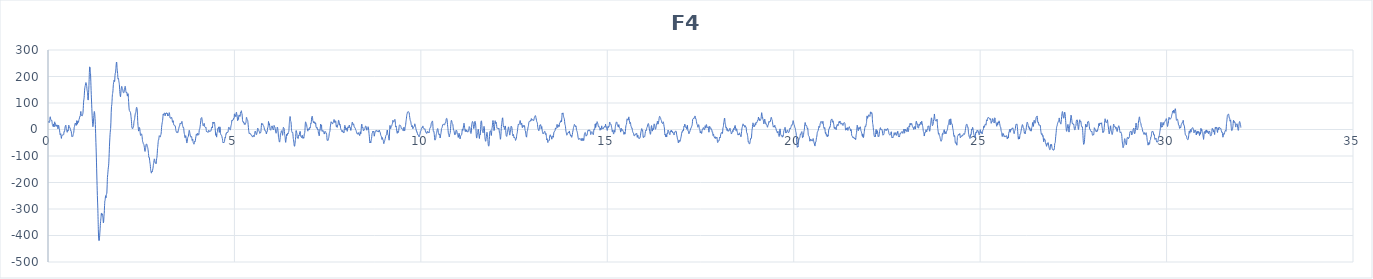
| Category | F4 |
|---|---|
| 0.0 | 24.7 |
| 0.0078125 | 28.9 |
| 0.015625 | 31.4 |
| 0.0234375 | 27.4 |
| 0.03125 | 27.6 |
| 0.0390625 | 26.8 |
| 0.046875 | 31 |
| 0.0546875 | 44.9 |
| 0.0625 | 47.8 |
| 0.0703125 | 40.3 |
| 0.078125 | 37.4 |
| 0.0859375 | 34.8 |
| 0.09375 | 33.5 |
| 0.1015625 | 34.4 |
| 0.109375 | 26.9 |
| 0.1171875 | 18.6 |
| 0.125 | 17.2 |
| 0.1328125 | 12.1 |
| 0.140625 | 12.3 |
| 0.1484375 | 20.6 |
| 0.15625 | 14.6 |
| 0.1640625 | 9.6 |
| 0.171875 | 24.5 |
| 0.1796875 | 29 |
| 0.1875 | 21.6 |
| 0.1953125 | 23 |
| 0.203125 | 18.4 |
| 0.2109375 | 12.3 |
| 0.21875 | 17.4 |
| 0.2265625 | 16 |
| 0.234375 | 12 |
| 0.2421875 | 16.7 |
| 0.25 | 15.9 |
| 0.2578125 | 7.8 |
| 0.265625 | 2.4 |
| 0.2734375 | 6.6 |
| 0.28125 | 15.7 |
| 0.2890625 | 13.8 |
| 0.296875 | 5.8 |
| 0.3046875 | 2 |
| 0.3125 | -5.3 |
| 0.3203125 | -15.6 |
| 0.328125 | -20.4 |
| 0.3359375 | -17.6 |
| 0.34375 | -16.3 |
| 0.3515625 | -27.1 |
| 0.359375 | -33.7 |
| 0.3671875 | -26 |
| 0.375 | -21.8 |
| 0.3828125 | -21.9 |
| 0.390625 | -20.1 |
| 0.3984375 | -20.5 |
| 0.40625 | -19.9 |
| 0.4140625 | -20.1 |
| 0.421875 | -18.5 |
| 0.4296875 | -9 |
| 0.4375 | -6.4 |
| 0.4453125 | -7.1 |
| 0.453125 | 4.2 |
| 0.4609375 | 11.5 |
| 0.46875 | 12.5 |
| 0.4765625 | 16.5 |
| 0.484375 | 9.8 |
| 0.4921875 | -0.5 |
| 0.5 | -0.7 |
| 0.5078125 | -5.7 |
| 0.515625 | -10.5 |
| 0.5234375 | -3.7 |
| 0.53125 | -3.2 |
| 0.5390625 | -5.9 |
| 0.546875 | 5.3 |
| 0.5546875 | 15.7 |
| 0.5625 | 14.8 |
| 0.5703125 | 10.9 |
| 0.578125 | 7 |
| 0.5859375 | 6.7 |
| 0.59375 | 6.8 |
| 0.6015625 | -0.3 |
| 0.609375 | -5.4 |
| 0.6171875 | -4.6 |
| 0.625 | -9.1 |
| 0.6328125 | -19.4 |
| 0.640625 | -26.6 |
| 0.6484375 | -26.3 |
| 0.65625 | -24.3 |
| 0.6640625 | -25.9 |
| 0.671875 | -21.9 |
| 0.6796875 | -15.2 |
| 0.6875 | -14.1 |
| 0.6953125 | -4.9 |
| 0.703125 | 8.3 |
| 0.7109375 | 11.1 |
| 0.71875 | 16.6 |
| 0.7265625 | 22.5 |
| 0.734375 | 20 |
| 0.7421875 | 23.3 |
| 0.75 | 23.9 |
| 0.7578125 | 15.4 |
| 0.765625 | 22.3 |
| 0.7734375 | 33.6 |
| 0.78125 | 25.6 |
| 0.7890625 | 19.9 |
| 0.796875 | 28.8 |
| 0.8046875 | 31.7 |
| 0.8125 | 26.7 |
| 0.8203125 | 29.5 |
| 0.828125 | 36.5 |
| 0.8359375 | 38.7 |
| 0.84375 | 43.3 |
| 0.8515625 | 49.1 |
| 0.859375 | 48.6 |
| 0.8671875 | 53.1 |
| 0.875 | 65.6 |
| 0.8828125 | 67.6 |
| 0.890625 | 57.3 |
| 0.8984375 | 51.7 |
| 0.90625 | 52.4 |
| 0.9140625 | 51.3 |
| 0.921875 | 52.2 |
| 0.9296875 | 57.1 |
| 0.9375 | 62.9 |
| 0.9453125 | 78.7 |
| 0.953125 | 100.9 |
| 0.9609375 | 112.1 |
| 0.96875 | 120.2 |
| 0.9765625 | 137.4 |
| 0.984375 | 153.1 |
| 0.9921875 | 160.9 |
| 1.0 | 165.9 |
| 1.0078125 | 172 |
| 1.015625 | 177 |
| 1.0234375 | 176.1 |
| 1.03125 | 171.1 |
| 1.0390625 | 161.8 |
| 1.046875 | 149.6 |
| 1.0546875 | 143.8 |
| 1.0625 | 134.4 |
| 1.0703125 | 114.8 |
| 1.078125 | 111 |
| 1.0859375 | 129.7 |
| 1.09375 | 151.9 |
| 1.1015625 | 179.8 |
| 1.109375 | 215 |
| 1.1171875 | 236.2 |
| 1.125 | 235.4 |
| 1.1328125 | 226.7 |
| 1.140625 | 212 |
| 1.1484375 | 182.4 |
| 1.15625 | 147.2 |
| 1.1640625 | 119.2 |
| 1.171875 | 93.1 |
| 1.1796875 | 66.1 |
| 1.1875 | 42.6 |
| 1.1953125 | 21.9 |
| 1.203125 | 10.5 |
| 1.2109375 | 15 |
| 1.21875 | 28.4 |
| 1.2265625 | 44.6 |
| 1.234375 | 60.3 |
| 1.2421875 | 68.1 |
| 1.25 | 63.6 |
| 1.2578125 | 50.3 |
| 1.265625 | 31.6 |
| 1.2734375 | 3.4 |
| 1.28125 | -32.3 |
| 1.2890625 | -66.6 |
| 1.296875 | -104.2 |
| 1.3046875 | -148.6 |
| 1.3125 | -191.3 |
| 1.3203125 | -231.2 |
| 1.328125 | -266 |
| 1.3359375 | -297.1 |
| 1.34375 | -339.7 |
| 1.3515625 | -386.7 |
| 1.359375 | -412.9 |
| 1.3671875 | -419.6 |
| 1.375 | -417.6 |
| 1.3828125 | -406.4 |
| 1.390625 | -390.3 |
| 1.3984375 | -372.5 |
| 1.40625 | -354 |
| 1.4140625 | -342.4 |
| 1.421875 | -331.1 |
| 1.4296875 | -316.3 |
| 1.4375 | -316.2 |
| 1.4453125 | -323.5 |
| 1.453125 | -319.9 |
| 1.4609375 | -318.5 |
| 1.46875 | -325.4 |
| 1.4765625 | -337.2 |
| 1.484375 | -352.2 |
| 1.4921875 | -348.6 |
| 1.5 | -330.7 |
| 1.5078125 | -317.2 |
| 1.515625 | -292.4 |
| 1.5234375 | -270.4 |
| 1.53125 | -267.2 |
| 1.5390625 | -255.7 |
| 1.546875 | -249.7 |
| 1.5546875 | -258.1 |
| 1.5625 | -249.2 |
| 1.5703125 | -241.9 |
| 1.578125 | -241.7 |
| 1.5859375 | -213.2 |
| 1.59375 | -181.3 |
| 1.6015625 | -170.2 |
| 1.609375 | -157.3 |
| 1.6171875 | -144.7 |
| 1.625 | -137.2 |
| 1.6328125 | -119.3 |
| 1.640625 | -91.2 |
| 1.6484375 | -63.1 |
| 1.65625 | -39.6 |
| 1.6640625 | -19.7 |
| 1.671875 | -5.6 |
| 1.6796875 | 3.7 |
| 1.6875 | 27.7 |
| 1.6953125 | 64.9 |
| 1.703125 | 86.3 |
| 1.7109375 | 93.9 |
| 1.71875 | 110.9 |
| 1.7265625 | 130 |
| 1.734375 | 137.1 |
| 1.7421875 | 146.2 |
| 1.75 | 164.3 |
| 1.7578125 | 175.1 |
| 1.765625 | 180.9 |
| 1.7734375 | 186.3 |
| 1.78125 | 180.2 |
| 1.7890625 | 182.3 |
| 1.796875 | 203.5 |
| 1.8046875 | 212.1 |
| 1.8125 | 213.3 |
| 1.8203125 | 228.1 |
| 1.828125 | 243.6 |
| 1.8359375 | 254.6 |
| 1.84375 | 252.6 |
| 1.8515625 | 233.5 |
| 1.859375 | 221.8 |
| 1.8671875 | 211.4 |
| 1.875 | 192.4 |
| 1.8828125 | 189.8 |
| 1.890625 | 192.7 |
| 1.8984375 | 183.1 |
| 1.90625 | 177.4 |
| 1.9140625 | 169.1 |
| 1.921875 | 150.6 |
| 1.9296875 | 136.9 |
| 1.9375 | 127.3 |
| 1.9453125 | 123.5 |
| 1.953125 | 135 |
| 1.9609375 | 149.1 |
| 1.96875 | 157.6 |
| 1.9765625 | 162.8 |
| 1.984375 | 159.8 |
| 1.9921875 | 153.5 |
| 2.0 | 151.6 |
| 2.0078125 | 146.5 |
| 2.015625 | 140.3 |
| 2.0234375 | 139.5 |
| 2.03125 | 138.3 |
| 2.0390625 | 140.4 |
| 2.046875 | 149.9 |
| 2.0546875 | 156.2 |
| 2.0625 | 159.6 |
| 2.0703125 | 163.3 |
| 2.078125 | 158.4 |
| 2.0859375 | 147.4 |
| 2.09375 | 140.1 |
| 2.1015625 | 138.5 |
| 2.109375 | 140.8 |
| 2.1171875 | 138.9 |
| 2.125 | 129.4 |
| 2.1328125 | 126.3 |
| 2.140625 | 134.3 |
| 2.1484375 | 135 |
| 2.15625 | 119.9 |
| 2.1640625 | 101.2 |
| 2.171875 | 84.5 |
| 2.1796875 | 72.6 |
| 2.1875 | 70.4 |
| 2.1953125 | 69.9 |
| 2.203125 | 66.4 |
| 2.2109375 | 64.7 |
| 2.21875 | 58.8 |
| 2.2265625 | 48.4 |
| 2.234375 | 38.6 |
| 2.2421875 | 23 |
| 2.25 | 8.8 |
| 2.2578125 | 4.9 |
| 2.265625 | 2.7 |
| 2.2734375 | 3.9 |
| 2.28125 | 8.9 |
| 2.2890625 | 8.9 |
| 2.296875 | 14.4 |
| 2.3046875 | 27.8 |
| 2.3125 | 34 |
| 2.3203125 | 37.3 |
| 2.328125 | 46.1 |
| 2.3359375 | 55 |
| 2.34375 | 61.2 |
| 2.3515625 | 64.1 |
| 2.359375 | 68.5 |
| 2.3671875 | 78.6 |
| 2.375 | 83.8 |
| 2.3828125 | 82.3 |
| 2.390625 | 77.8 |
| 2.3984375 | 58 |
| 2.40625 | 29.7 |
| 2.4140625 | 14.9 |
| 2.421875 | 4.8 |
| 2.4296875 | -6.1 |
| 2.4375 | -3.2 |
| 2.4453125 | 6 |
| 2.453125 | 7.7 |
| 2.4609375 | 3.3 |
| 2.46875 | -7 |
| 2.4765625 | -18.2 |
| 2.484375 | -22.7 |
| 2.4921875 | -21.4 |
| 2.5 | -17.5 |
| 2.5078125 | -16.4 |
| 2.515625 | -19.8 |
| 2.5234375 | -26.3 |
| 2.53125 | -37.6 |
| 2.5390625 | -45.7 |
| 2.546875 | -48.3 |
| 2.5546875 | -52.9 |
| 2.5625 | -55.3 |
| 2.5703125 | -56.4 |
| 2.578125 | -61.9 |
| 2.5859375 | -68.9 |
| 2.59375 | -77.5 |
| 2.6015625 | -82.8 |
| 2.609375 | -79.3 |
| 2.6171875 | -72.3 |
| 2.625 | -62.4 |
| 2.6328125 | -55.2 |
| 2.640625 | -55.4 |
| 2.6484375 | -55.2 |
| 2.65625 | -59 |
| 2.6640625 | -65.8 |
| 2.671875 | -67.5 |
| 2.6796875 | -72.6 |
| 2.6875 | -81.1 |
| 2.6953125 | -90.7 |
| 2.703125 | -104 |
| 2.7109375 | -106.3 |
| 2.71875 | -105.6 |
| 2.7265625 | -117.9 |
| 2.734375 | -126.2 |
| 2.7421875 | -132.6 |
| 2.75 | -147 |
| 2.7578125 | -155.6 |
| 2.765625 | -161.1 |
| 2.7734375 | -164.7 |
| 2.78125 | -158.6 |
| 2.7890625 | -157.4 |
| 2.796875 | -159.8 |
| 2.8046875 | -154 |
| 2.8125 | -148.3 |
| 2.8203125 | -141.2 |
| 2.828125 | -130.9 |
| 2.8359375 | -125 |
| 2.84375 | -117.5 |
| 2.8515625 | -111 |
| 2.859375 | -113 |
| 2.8671875 | -119.2 |
| 2.875 | -125.7 |
| 2.8828125 | -126.7 |
| 2.890625 | -125.9 |
| 2.8984375 | -129.4 |
| 2.90625 | -122.2 |
| 2.9140625 | -109.8 |
| 2.921875 | -104.4 |
| 2.9296875 | -89.8 |
| 2.9375 | -72.1 |
| 2.9453125 | -63.4 |
| 2.953125 | -50.2 |
| 2.9609375 | -40.9 |
| 2.96875 | -39.4 |
| 2.9765625 | -30.1 |
| 2.984375 | -23.4 |
| 2.9921875 | -25 |
| 3.0 | -26.1 |
| 3.0078125 | -28.8 |
| 3.015625 | -26.4 |
| 3.0234375 | -20.2 |
| 3.03125 | -17.7 |
| 3.0390625 | -7.2 |
| 3.046875 | 8.4 |
| 3.0546875 | 17.8 |
| 3.0625 | 25.5 |
| 3.0703125 | 30.5 |
| 3.078125 | 39.7 |
| 3.0859375 | 55.8 |
| 3.09375 | 58.5 |
| 3.1015625 | 53.9 |
| 3.109375 | 58 |
| 3.1171875 | 61.3 |
| 3.125 | 62.8 |
| 3.1328125 | 60.6 |
| 3.140625 | 51.8 |
| 3.1484375 | 53.8 |
| 3.15625 | 61.1 |
| 3.1640625 | 60.2 |
| 3.171875 | 62.3 |
| 3.1796875 | 63.1 |
| 3.1875 | 59.4 |
| 3.1953125 | 62.1 |
| 3.203125 | 59.4 |
| 3.2109375 | 51.1 |
| 3.21875 | 53.2 |
| 3.2265625 | 55.1 |
| 3.234375 | 53.1 |
| 3.2421875 | 58.1 |
| 3.25 | 63.6 |
| 3.2578125 | 61.2 |
| 3.265625 | 52.2 |
| 3.2734375 | 43.7 |
| 3.28125 | 43.3 |
| 3.2890625 | 43.7 |
| 3.296875 | 41.6 |
| 3.3046875 | 44.1 |
| 3.3125 | 46.3 |
| 3.3203125 | 43.7 |
| 3.328125 | 38.7 |
| 3.3359375 | 30.5 |
| 3.34375 | 27.2 |
| 3.3515625 | 32.9 |
| 3.359375 | 32.1 |
| 3.3671875 | 22.1 |
| 3.375 | 16.9 |
| 3.3828125 | 17 |
| 3.390625 | 15.4 |
| 3.3984375 | 14.2 |
| 3.40625 | 15 |
| 3.4140625 | 12.8 |
| 3.421875 | 4.7 |
| 3.4296875 | -3.3 |
| 3.4375 | -6.9 |
| 3.4453125 | -9.8 |
| 3.453125 | -11.7 |
| 3.4609375 | -9.7 |
| 3.46875 | -8.4 |
| 3.4765625 | -11.3 |
| 3.484375 | -11.5 |
| 3.4921875 | -5.3 |
| 3.5 | 0.6 |
| 3.5078125 | 4 |
| 3.515625 | 9 |
| 3.5234375 | 12 |
| 3.53125 | 13.6 |
| 3.5390625 | 20.3 |
| 3.546875 | 24.6 |
| 3.5546875 | 22.4 |
| 3.5625 | 23 |
| 3.5703125 | 23.5 |
| 3.578125 | 22.6 |
| 3.5859375 | 28.5 |
| 3.59375 | 30.3 |
| 3.6015625 | 21.3 |
| 3.609375 | 15.2 |
| 3.6171875 | 11.2 |
| 3.625 | 6.8 |
| 3.6328125 | 8.2 |
| 3.640625 | 4.1 |
| 3.6484375 | -9.1 |
| 3.65625 | -15.7 |
| 3.6640625 | -19.9 |
| 3.671875 | -29.3 |
| 3.6796875 | -30.9 |
| 3.6875 | -24.6 |
| 3.6953125 | -23.5 |
| 3.703125 | -29.5 |
| 3.7109375 | -39.4 |
| 3.71875 | -48.8 |
| 3.7265625 | -50.8 |
| 3.734375 | -44.2 |
| 3.7421875 | -34.7 |
| 3.75 | -29.3 |
| 3.7578125 | -28.2 |
| 3.765625 | -24.7 |
| 3.7734375 | -16.2 |
| 3.78125 | -6.9 |
| 3.7890625 | -2.9 |
| 3.796875 | -6.9 |
| 3.8046875 | -14.2 |
| 3.8125 | -20.7 |
| 3.8203125 | -25.5 |
| 3.828125 | -28.1 |
| 3.8359375 | -29.3 |
| 3.84375 | -27.7 |
| 3.8515625 | -26.7 |
| 3.859375 | -34.6 |
| 3.8671875 | -41.6 |
| 3.875 | -37.2 |
| 3.8828125 | -36.7 |
| 3.890625 | -45.8 |
| 3.8984375 | -50 |
| 3.90625 | -51.5 |
| 3.9140625 | -55.5 |
| 3.921875 | -52 |
| 3.9296875 | -45.1 |
| 3.9375 | -46 |
| 3.9453125 | -46.5 |
| 3.953125 | -40.1 |
| 3.9609375 | -32.6 |
| 3.96875 | -25.9 |
| 3.9765625 | -19.1 |
| 3.984375 | -16.7 |
| 3.9921875 | -21.1 |
| 4.0 | -22.2 |
| 4.0078125 | -15.3 |
| 4.015625 | -14.3 |
| 4.0234375 | -19.8 |
| 4.03125 | -20.5 |
| 4.0390625 | -20.5 |
| 4.046875 | -17.2 |
| 4.0546875 | -4.8 |
| 4.0625 | 1.9 |
| 4.0703125 | 2.2 |
| 4.078125 | 9.5 |
| 4.0859375 | 18.5 |
| 4.09375 | 28.2 |
| 4.1015625 | 40.3 |
| 4.109375 | 43.9 |
| 4.1171875 | 44 |
| 4.125 | 44.6 |
| 4.1328125 | 36.2 |
| 4.140625 | 26.7 |
| 4.1484375 | 22.3 |
| 4.15625 | 16.1 |
| 4.1640625 | 13.2 |
| 4.171875 | 13.9 |
| 4.1796875 | 16.9 |
| 4.1875 | 23.1 |
| 4.1953125 | 19.6 |
| 4.203125 | 10.7 |
| 4.2109375 | 10.1 |
| 4.21875 | 8.7 |
| 4.2265625 | 7.3 |
| 4.234375 | 8.8 |
| 4.2421875 | 0.7 |
| 4.25 | -7.8 |
| 4.2578125 | -6.8 |
| 4.265625 | -8 |
| 4.2734375 | -10.2 |
| 4.28125 | -9.2 |
| 4.2890625 | -10.5 |
| 4.296875 | -10.4 |
| 4.3046875 | -5.7 |
| 4.3125 | -2.5 |
| 4.3203125 | -4.8 |
| 4.328125 | -7.8 |
| 4.3359375 | -7.7 |
| 4.34375 | -6.5 |
| 4.3515625 | -5.3 |
| 4.359375 | -6.1 |
| 4.3671875 | -6.5 |
| 4.375 | -2 |
| 4.3828125 | 3.1 |
| 4.390625 | 8 |
| 4.3984375 | 8.9 |
| 4.40625 | 5.5 |
| 4.4140625 | 15.2 |
| 4.421875 | 27.9 |
| 4.4296875 | 23.9 |
| 4.4375 | 23 |
| 4.4453125 | 28.2 |
| 4.453125 | 26.7 |
| 4.4609375 | 27.5 |
| 4.46875 | 23.2 |
| 4.4765625 | 11.6 |
| 4.484375 | 2.7 |
| 4.4921875 | -13.1 |
| 4.5 | -21.9 |
| 4.5078125 | -16.4 |
| 4.515625 | -24.3 |
| 4.5234375 | -28.8 |
| 4.53125 | -14.2 |
| 4.5390625 | -10.1 |
| 4.546875 | -8.1 |
| 4.5546875 | 4 |
| 4.5625 | 5.1 |
| 4.5703125 | 4.3 |
| 4.578125 | 9.9 |
| 4.5859375 | 2.4 |
| 4.59375 | -11 |
| 4.6015625 | -5.4 |
| 4.609375 | 10.1 |
| 4.6171875 | 5.8 |
| 4.625 | -12.4 |
| 4.6328125 | -18.5 |
| 4.640625 | -19 |
| 4.6484375 | -22.1 |
| 4.65625 | -22.4 |
| 4.6640625 | -26.8 |
| 4.671875 | -32.3 |
| 4.6796875 | -36.1 |
| 4.6875 | -46 |
| 4.6953125 | -49.8 |
| 4.703125 | -47.2 |
| 4.7109375 | -50.5 |
| 4.71875 | -49.3 |
| 4.7265625 | -46.6 |
| 4.734375 | -45.2 |
| 4.7421875 | -34.1 |
| 4.75 | -29.3 |
| 4.7578125 | -32.4 |
| 4.765625 | -23.1 |
| 4.7734375 | -16 |
| 4.78125 | -17.6 |
| 4.7890625 | -12.9 |
| 4.796875 | -10.6 |
| 4.8046875 | -12.7 |
| 4.8125 | -10.8 |
| 4.8203125 | -11.1 |
| 4.828125 | -9.6 |
| 4.8359375 | -0.4 |
| 4.84375 | 7.2 |
| 4.8515625 | 8.9 |
| 4.859375 | 6.9 |
| 4.8671875 | 2.9 |
| 4.875 | 0.3 |
| 4.8828125 | -0.9 |
| 4.890625 | -1.2 |
| 4.8984375 | 4.1 |
| 4.90625 | 12.9 |
| 4.9140625 | 16.9 |
| 4.921875 | 22.2 |
| 4.9296875 | 33 |
| 4.9375 | 35.8 |
| 4.9453125 | 33.2 |
| 4.953125 | 36.1 |
| 4.9609375 | 36 |
| 4.96875 | 36.2 |
| 4.9765625 | 42.3 |
| 4.984375 | 41.2 |
| 4.9921875 | 43.2 |
| 5.0 | 57.8 |
| 5.0078125 | 59.3 |
| 5.015625 | 50.2 |
| 5.0234375 | 52.8 |
| 5.03125 | 51.9 |
| 5.0390625 | 48.5 |
| 5.046875 | 60.1 |
| 5.0546875 | 65.5 |
| 5.0625 | 58.6 |
| 5.0703125 | 54.6 |
| 5.078125 | 42.4 |
| 5.0859375 | 33.4 |
| 5.09375 | 41 |
| 5.1015625 | 39.6 |
| 5.109375 | 38.2 |
| 5.1171875 | 51.7 |
| 5.125 | 55 |
| 5.1328125 | 52.2 |
| 5.140625 | 53.2 |
| 5.1484375 | 49.1 |
| 5.15625 | 54.9 |
| 5.1640625 | 64.2 |
| 5.171875 | 62.4 |
| 5.1796875 | 67.7 |
| 5.1875 | 70.7 |
| 5.1953125 | 62.1 |
| 5.203125 | 58.8 |
| 5.2109375 | 47.6 |
| 5.21875 | 30.9 |
| 5.2265625 | 31.7 |
| 5.234375 | 31.1 |
| 5.2421875 | 25.4 |
| 5.25 | 27.8 |
| 5.2578125 | 24.1 |
| 5.265625 | 19.2 |
| 5.2734375 | 22.5 |
| 5.28125 | 20.7 |
| 5.2890625 | 19.2 |
| 5.296875 | 23 |
| 5.3046875 | 23.7 |
| 5.3125 | 31 |
| 5.3203125 | 44.3 |
| 5.328125 | 45.3 |
| 5.3359375 | 38.7 |
| 5.34375 | 37.2 |
| 5.3515625 | 36.4 |
| 5.359375 | 30.5 |
| 5.3671875 | 19.8 |
| 5.375 | 7.3 |
| 5.3828125 | -3.5 |
| 5.390625 | -11.8 |
| 5.3984375 | -15.6 |
| 5.40625 | -13.5 |
| 5.4140625 | -13.5 |
| 5.421875 | -17.1 |
| 5.4296875 | -17.1 |
| 5.4375 | -16.7 |
| 5.4453125 | -19.5 |
| 5.453125 | -21.5 |
| 5.4609375 | -23.9 |
| 5.46875 | -25.6 |
| 5.4765625 | -24.7 |
| 5.484375 | -26.5 |
| 5.4921875 | -28.7 |
| 5.5 | -25.8 |
| 5.5078125 | -21.9 |
| 5.515625 | -22.8 |
| 5.5234375 | -26.1 |
| 5.53125 | -26.7 |
| 5.5390625 | -22.5 |
| 5.546875 | -13.7 |
| 5.5546875 | -6.6 |
| 5.5625 | -7.2 |
| 5.5703125 | -10 |
| 5.578125 | -13.1 |
| 5.5859375 | -18.8 |
| 5.59375 | -19.3 |
| 5.6015625 | -15 |
| 5.609375 | -9.9 |
| 5.6171875 | -0.2 |
| 5.625 | 5.4 |
| 5.6328125 | 1.5 |
| 5.640625 | 0 |
| 5.6484375 | -1 |
| 5.65625 | -5.3 |
| 5.6640625 | -7 |
| 5.671875 | -10.3 |
| 5.6796875 | -14.7 |
| 5.6875 | -12.8 |
| 5.6953125 | -10.7 |
| 5.703125 | -11.9 |
| 5.7109375 | -7 |
| 5.71875 | 6.9 |
| 5.7265625 | 20.9 |
| 5.734375 | 23.6 |
| 5.7421875 | 18.9 |
| 5.75 | 19.6 |
| 5.7578125 | 21.6 |
| 5.765625 | 17.5 |
| 5.7734375 | 14.7 |
| 5.78125 | 14 |
| 5.7890625 | 11 |
| 5.796875 | 6.9 |
| 5.8046875 | 0.8 |
| 5.8125 | -2.8 |
| 5.8203125 | -1.5 |
| 5.828125 | -4.4 |
| 5.8359375 | -6.9 |
| 5.84375 | -6.6 |
| 5.8515625 | -14 |
| 5.859375 | -16.6 |
| 5.8671875 | -9.5 |
| 5.875 | -9.6 |
| 5.8828125 | -5.3 |
| 5.890625 | 6.7 |
| 5.8984375 | 7.9 |
| 5.90625 | 15.4 |
| 5.9140625 | 30.3 |
| 5.921875 | 24.2 |
| 5.9296875 | 16.6 |
| 5.9375 | 21.9 |
| 5.9453125 | 14.3 |
| 5.953125 | 1.2 |
| 5.9609375 | -0.5 |
| 5.96875 | -2 |
| 5.9765625 | -2.3 |
| 5.984375 | 5.4 |
| 5.9921875 | 11.4 |
| 6.0 | 11.8 |
| 6.0078125 | 13.3 |
| 6.015625 | 12.8 |
| 6.0234375 | 5 |
| 6.03125 | 0.9 |
| 6.0390625 | 1.5 |
| 6.046875 | -1.6 |
| 6.0546875 | 3.8 |
| 6.0625 | 15.4 |
| 6.0703125 | 13.9 |
| 6.078125 | 9.7 |
| 6.0859375 | 9.4 |
| 6.09375 | 2.9 |
| 6.1015625 | -5.5 |
| 6.109375 | -11.8 |
| 6.1171875 | -14.2 |
| 6.125 | -11.7 |
| 6.1328125 | -9.6 |
| 6.140625 | -1.7 |
| 6.1484375 | 8.7 |
| 6.15625 | 7.5 |
| 6.1640625 | 1.1 |
| 6.171875 | -8.9 |
| 6.1796875 | -25 |
| 6.1875 | -34.2 |
| 6.1953125 | -38.9 |
| 6.203125 | -45.9 |
| 6.2109375 | -47.5 |
| 6.21875 | -42.9 |
| 6.2265625 | -31.4 |
| 6.234375 | -17.6 |
| 6.2421875 | -13.4 |
| 6.25 | -11.4 |
| 6.2578125 | -5.5 |
| 6.265625 | -4.8 |
| 6.2734375 | -7.5 |
| 6.28125 | -13 |
| 6.2890625 | -21.8 |
| 6.296875 | -18.1 |
| 6.3046875 | -1 |
| 6.3125 | 8 |
| 6.3203125 | 6 |
| 6.328125 | 5.6 |
| 6.3359375 | 0.3 |
| 6.34375 | -14.5 |
| 6.3515625 | -23 |
| 6.359375 | -28.7 |
| 6.3671875 | -43 |
| 6.375 | -48.6 |
| 6.3828125 | -41 |
| 6.390625 | -32.1 |
| 6.3984375 | -20.3 |
| 6.40625 | -17.1 |
| 6.4140625 | -22.5 |
| 6.421875 | -16.8 |
| 6.4296875 | -13.1 |
| 6.4375 | -16.6 |
| 6.4453125 | -12.3 |
| 6.453125 | -10 |
| 6.4609375 | -4.4 |
| 6.46875 | 15.9 |
| 6.4765625 | 30.5 |
| 6.484375 | 39.2 |
| 6.4921875 | 49 |
| 6.5 | 42.8 |
| 6.5078125 | 31.4 |
| 6.515625 | 29.4 |
| 6.5234375 | 17.6 |
| 6.53125 | -1.4 |
| 6.5390625 | -8 |
| 6.546875 | -10.6 |
| 6.5546875 | -13 |
| 6.5625 | -12 |
| 6.5703125 | -20.5 |
| 6.578125 | -33.9 |
| 6.5859375 | -39.4 |
| 6.59375 | -47.7 |
| 6.6015625 | -58.5 |
| 6.609375 | -63.2 |
| 6.6171875 | -61.7 |
| 6.625 | -51.5 |
| 6.6328125 | -42 |
| 6.640625 | -31.5 |
| 6.6484375 | -10.8 |
| 6.65625 | -3.9 |
| 6.6640625 | -11 |
| 6.671875 | -11.6 |
| 6.6796875 | -20.1 |
| 6.6875 | -31.5 |
| 6.6953125 | -30.9 |
| 6.703125 | -33.9 |
| 6.7109375 | -33.1 |
| 6.71875 | -22.6 |
| 6.7265625 | -22.3 |
| 6.734375 | -23.8 |
| 6.7421875 | -17.6 |
| 6.75 | -12.5 |
| 6.7578125 | -7.4 |
| 6.765625 | -8.5 |
| 6.7734375 | -20 |
| 6.78125 | -26.5 |
| 6.7890625 | -26.5 |
| 6.796875 | -29.7 |
| 6.8046875 | -30.7 |
| 6.8125 | -25.1 |
| 6.8203125 | -21.6 |
| 6.828125 | -27.6 |
| 6.8359375 | -33.4 |
| 6.84375 | -29.4 |
| 6.8515625 | -28.2 |
| 6.859375 | -32.9 |
| 6.8671875 | -26 |
| 6.875 | -15.9 |
| 6.8828125 | -14.8 |
| 6.890625 | -4.4 |
| 6.8984375 | 17 |
| 6.90625 | 28.9 |
| 6.9140625 | 28 |
| 6.921875 | 23.5 |
| 6.9296875 | 21.5 |
| 6.9375 | 17.1 |
| 6.9453125 | 8.5 |
| 6.953125 | 3.8 |
| 6.9609375 | -2.2 |
| 6.96875 | -6.3 |
| 6.9765625 | 0.2 |
| 6.984375 | 1.2 |
| 6.9921875 | -0.8 |
| 7.0 | 3.7 |
| 7.0078125 | 0.4 |
| 7.015625 | 0.5 |
| 7.0234375 | 8.3 |
| 7.03125 | 6.2 |
| 7.0390625 | 11.9 |
| 7.046875 | 24.1 |
| 7.0546875 | 22.5 |
| 7.0625 | 29.1 |
| 7.0703125 | 43.8 |
| 7.078125 | 47.5 |
| 7.0859375 | 50.4 |
| 7.09375 | 46.1 |
| 7.1015625 | 34.8 |
| 7.109375 | 31.9 |
| 7.1171875 | 27.2 |
| 7.125 | 25 |
| 7.1328125 | 29.9 |
| 7.140625 | 26 |
| 7.1484375 | 25.8 |
| 7.15625 | 28.4 |
| 7.1640625 | 21.2 |
| 7.171875 | 23.9 |
| 7.1796875 | 24.8 |
| 7.1875 | 10.4 |
| 7.1953125 | 8.1 |
| 7.203125 | 9.5 |
| 7.2109375 | 4.5 |
| 7.21875 | 6.8 |
| 7.2265625 | 3.1 |
| 7.234375 | -1.8 |
| 7.2421875 | 0.2 |
| 7.25 | -9.2 |
| 7.2578125 | -16.1 |
| 7.265625 | -17.1 |
| 7.2734375 | -23.8 |
| 7.28125 | -13.7 |
| 7.2890625 | -0.9 |
| 7.296875 | -2.8 |
| 7.3046875 | 9.8 |
| 7.3125 | 20.3 |
| 7.3203125 | 13 |
| 7.328125 | 17.2 |
| 7.3359375 | 16 |
| 7.34375 | -1.9 |
| 7.3515625 | -6.7 |
| 7.359375 | -4.7 |
| 7.3671875 | -6.5 |
| 7.375 | -4 |
| 7.3828125 | -6.1 |
| 7.390625 | -9.9 |
| 7.3984375 | -10.5 |
| 7.40625 | -16.3 |
| 7.4140625 | -16.5 |
| 7.421875 | -8.5 |
| 7.4296875 | -7.7 |
| 7.4375 | -9 |
| 7.4453125 | -8.2 |
| 7.453125 | -12.6 |
| 7.4609375 | -15.4 |
| 7.46875 | -14.6 |
| 7.4765625 | -23.4 |
| 7.484375 | -37.8 |
| 7.4921875 | -41.3 |
| 7.5 | -38.8 |
| 7.5078125 | -40.8 |
| 7.515625 | -39.8 |
| 7.5234375 | -34.2 |
| 7.53125 | -29.8 |
| 7.5390625 | -20.9 |
| 7.546875 | -11.5 |
| 7.5546875 | -10.4 |
| 7.5625 | -4.7 |
| 7.5703125 | 8.6 |
| 7.578125 | 16.5 |
| 7.5859375 | 23.6 |
| 7.59375 | 29.2 |
| 7.6015625 | 26.1 |
| 7.609375 | 24.8 |
| 7.6171875 | 25.6 |
| 7.625 | 21.1 |
| 7.6328125 | 21.2 |
| 7.640625 | 25.3 |
| 7.6484375 | 25.8 |
| 7.65625 | 28.8 |
| 7.6640625 | 34.7 |
| 7.671875 | 37.8 |
| 7.6796875 | 35.3 |
| 7.6875 | 28.5 |
| 7.6953125 | 25.8 |
| 7.703125 | 28.8 |
| 7.7109375 | 32.7 |
| 7.71875 | 30.6 |
| 7.7265625 | 17 |
| 7.734375 | 10.2 |
| 7.7421875 | 15.1 |
| 7.75 | 10.3 |
| 7.7578125 | 8.1 |
| 7.765625 | 16.2 |
| 7.7734375 | 16 |
| 7.78125 | 21.1 |
| 7.7890625 | 34.4 |
| 7.796875 | 34.8 |
| 7.8046875 | 30.7 |
| 7.8125 | 25.1 |
| 7.8203125 | 16.5 |
| 7.828125 | 18.4 |
| 7.8359375 | 18.8 |
| 7.84375 | 8.8 |
| 7.8515625 | 2.8 |
| 7.859375 | -0.6 |
| 7.8671875 | -3.3 |
| 7.875 | -3.3 |
| 7.8828125 | -7.1 |
| 7.890625 | -9.6 |
| 7.8984375 | -5 |
| 7.90625 | -3.7 |
| 7.9140625 | -9 |
| 7.921875 | -11.8 |
| 7.9296875 | -12 |
| 7.9375 | -12.7 |
| 7.9453125 | -4 |
| 7.953125 | 11.5 |
| 7.9609375 | 16.1 |
| 7.96875 | 12.9 |
| 7.9765625 | 9.7 |
| 7.984375 | 2.1 |
| 7.9921875 | -2.4 |
| 8.0 | 2.2 |
| 8.0078125 | 5.9 |
| 8.015625 | 1.4 |
| 8.0234375 | -6.5 |
| 8.03125 | -4.6 |
| 8.0390625 | 6.6 |
| 8.046875 | 10.3 |
| 8.0546875 | 6.7 |
| 8.0625 | 6 |
| 8.0703125 | 9.7 |
| 8.078125 | 16.2 |
| 8.0859375 | 15.5 |
| 8.09375 | 6.8 |
| 8.1015625 | 6.2 |
| 8.109375 | 6.9 |
| 8.1171875 | -2 |
| 8.125 | -2.8 |
| 8.1328125 | 6.9 |
| 8.140625 | 11.2 |
| 8.1484375 | 16.1 |
| 8.15625 | 25.5 |
| 8.1640625 | 28 |
| 8.171875 | 22.6 |
| 8.1796875 | 18.1 |
| 8.1875 | 19.4 |
| 8.1953125 | 21.4 |
| 8.203125 | 16.9 |
| 8.2109375 | 10.4 |
| 8.21875 | 7.8 |
| 8.2265625 | 7.5 |
| 8.234375 | 7.2 |
| 8.2421875 | 3.9 |
| 8.25 | -1.3 |
| 8.2578125 | -2.9 |
| 8.265625 | -4.7 |
| 8.2734375 | -10.4 |
| 8.28125 | -14.4 |
| 8.2890625 | -13.8 |
| 8.296875 | -12.7 |
| 8.3046875 | -15.5 |
| 8.3125 | -18.3 |
| 8.3203125 | -14.2 |
| 8.328125 | -12 |
| 8.3359375 | -17.4 |
| 8.34375 | -18.5 |
| 8.3515625 | -18.6 |
| 8.359375 | -23.1 |
| 8.3671875 | -17 |
| 8.375 | -8.6 |
| 8.3828125 | -15.3 |
| 8.390625 | -16.9 |
| 8.3984375 | -1.6 |
| 8.40625 | 13.6 |
| 8.4140625 | 20.5 |
| 8.421875 | 16.1 |
| 8.4296875 | 6.6 |
| 8.4375 | 5.9 |
| 8.4453125 | 7.6 |
| 8.453125 | 1 |
| 8.4609375 | -5.1 |
| 8.46875 | -3.8 |
| 8.4765625 | -0.9 |
| 8.484375 | -0.4 |
| 8.4921875 | 0.3 |
| 8.5 | 3.9 |
| 8.5078125 | 9.2 |
| 8.515625 | 12.7 |
| 8.5234375 | 12.8 |
| 8.53125 | 11.5 |
| 8.5390625 | 6.2 |
| 8.546875 | -1.8 |
| 8.5546875 | -2.3 |
| 8.5625 | 1.1 |
| 8.5703125 | 2.5 |
| 8.578125 | 7 |
| 8.5859375 | 10.5 |
| 8.59375 | 6.3 |
| 8.6015625 | -3.5 |
| 8.609375 | -15.1 |
| 8.6171875 | -25.5 |
| 8.625 | -39.4 |
| 8.6328125 | -50.5 |
| 8.640625 | -46.7 |
| 8.6484375 | -45.2 |
| 8.65625 | -50.7 |
| 8.6640625 | -44.5 |
| 8.671875 | -36.6 |
| 8.6796875 | -32 |
| 8.6875 | -20.1 |
| 8.6953125 | -13.7 |
| 8.703125 | -12.3 |
| 8.7109375 | -6.1 |
| 8.71875 | -6.8 |
| 8.7265625 | -8.8 |
| 8.734375 | -6.9 |
| 8.7421875 | -16.1 |
| 8.75 | -25.3 |
| 8.7578125 | -20.7 |
| 8.765625 | -13.9 |
| 8.7734375 | -9.2 |
| 8.78125 | -5.5 |
| 8.7890625 | -5.7 |
| 8.796875 | -5.6 |
| 8.8046875 | -3.6 |
| 8.8125 | -3.2 |
| 8.8203125 | -6.1 |
| 8.828125 | -8.6 |
| 8.8359375 | -6.8 |
| 8.84375 | -5.1 |
| 8.8515625 | -5.1 |
| 8.859375 | -5.5 |
| 8.8671875 | -9.4 |
| 8.875 | -9 |
| 8.8828125 | -2.8 |
| 8.890625 | -3.6 |
| 8.8984375 | -8.5 |
| 8.90625 | -9.8 |
| 8.9140625 | -13.4 |
| 8.921875 | -20 |
| 8.9296875 | -23.7 |
| 8.9375 | -24.5 |
| 8.9453125 | -29.3 |
| 8.953125 | -37.1 |
| 8.9609375 | -35 |
| 8.96875 | -30.4 |
| 8.9765625 | -35.9 |
| 8.984375 | -39.3 |
| 8.9921875 | -41 |
| 9.0 | -50.1 |
| 9.0078125 | -53.5 |
| 9.015625 | -49 |
| 9.0234375 | -46 |
| 9.03125 | -41.5 |
| 9.0390625 | -36.9 |
| 9.046875 | -33 |
| 9.0546875 | -26.8 |
| 9.0625 | -23 |
| 9.0703125 | -21.3 |
| 9.078125 | -18.9 |
| 9.0859375 | -14 |
| 9.09375 | -4.3 |
| 9.1015625 | -2 |
| 9.109375 | -12.3 |
| 9.1171875 | -20.1 |
| 9.125 | -21.5 |
| 9.1328125 | -24.1 |
| 9.140625 | -32.5 |
| 9.1484375 | -40.4 |
| 9.15625 | -27.8 |
| 9.1640625 | 0.6 |
| 9.171875 | 15.3 |
| 9.1796875 | 11 |
| 9.1875 | 3.5 |
| 9.1953125 | 4.9 |
| 9.203125 | 11.3 |
| 9.2109375 | 11.7 |
| 9.21875 | 13.5 |
| 9.2265625 | 18.7 |
| 9.234375 | 20.1 |
| 9.2421875 | 27.4 |
| 9.25 | 34.8 |
| 9.2578125 | 30.7 |
| 9.265625 | 28.2 |
| 9.2734375 | 28.8 |
| 9.28125 | 29 |
| 9.2890625 | 33.9 |
| 9.296875 | 37.2 |
| 9.3046875 | 38.2 |
| 9.3125 | 32.6 |
| 9.3203125 | 15.5 |
| 9.328125 | 9.2 |
| 9.3359375 | 13.5 |
| 9.34375 | 7.7 |
| 9.3515625 | -1.8 |
| 9.359375 | -10 |
| 9.3671875 | -14.4 |
| 9.375 | -8.1 |
| 9.3828125 | -5.5 |
| 9.390625 | -11.1 |
| 9.3984375 | -10.6 |
| 9.40625 | -3.4 |
| 9.4140625 | 6.3 |
| 9.421875 | 14.5 |
| 9.4296875 | 17.1 |
| 9.4375 | 17 |
| 9.4453125 | 16 |
| 9.453125 | 15.1 |
| 9.4609375 | 13.5 |
| 9.46875 | 7.9 |
| 9.4765625 | 3.8 |
| 9.484375 | 4.9 |
| 9.4921875 | 4.3 |
| 9.5 | 1.8 |
| 9.5078125 | 2.1 |
| 9.515625 | 0 |
| 9.5234375 | -5.2 |
| 9.53125 | -3.5 |
| 9.5390625 | 5 |
| 9.546875 | 9 |
| 9.5546875 | 3.1 |
| 9.5625 | -5.2 |
| 9.5703125 | -2.1 |
| 9.578125 | 7.4 |
| 9.5859375 | 12.1 |
| 9.59375 | 20.1 |
| 9.6015625 | 30.6 |
| 9.609375 | 37.6 |
| 9.6171875 | 47.9 |
| 9.625 | 56.4 |
| 9.6328125 | 59.8 |
| 9.640625 | 64.8 |
| 9.6484375 | 65.4 |
| 9.65625 | 64.9 |
| 9.6640625 | 67.4 |
| 9.671875 | 65.7 |
| 9.6796875 | 64.9 |
| 9.6875 | 62.4 |
| 9.6953125 | 52.4 |
| 9.703125 | 44.7 |
| 9.7109375 | 37.9 |
| 9.71875 | 32.4 |
| 9.7265625 | 31.6 |
| 9.734375 | 25.1 |
| 9.7421875 | 18 |
| 9.75 | 14.4 |
| 9.7578125 | 9.5 |
| 9.765625 | 13.1 |
| 9.7734375 | 14.3 |
| 9.78125 | 3.9 |
| 9.7890625 | 3.3 |
| 9.796875 | 8.1 |
| 9.8046875 | 7.8 |
| 9.8125 | 10.4 |
| 9.8203125 | 10.9 |
| 9.828125 | 13.9 |
| 9.8359375 | 21.3 |
| 9.84375 | 18.6 |
| 9.8515625 | 13.4 |
| 9.859375 | 10.1 |
| 9.8671875 | 3 |
| 9.875 | -1.5 |
| 9.8828125 | -6.5 |
| 9.890625 | -10.2 |
| 9.8984375 | -8.7 |
| 9.90625 | -13.9 |
| 9.9140625 | -19.2 |
| 9.921875 | -18.7 |
| 9.9296875 | -20.7 |
| 9.9375 | -21.5 |
| 9.9453125 | -24.6 |
| 9.953125 | -28 |
| 9.9609375 | -21.9 |
| 9.96875 | -19.5 |
| 9.9765625 | -18.4 |
| 9.984375 | -9.1 |
| 9.9921875 | -6.4 |
| 10.0 | -6.4 |
| 10.0078125 | 0 |
| 10.015625 | 3.8 |
| 10.0234375 | 6.4 |
| 10.03125 | 7 |
| 10.0390625 | 5.5 |
| 10.046875 | 10.6 |
| 10.0546875 | 13.4 |
| 10.0625 | 7.9 |
| 10.0703125 | 5.2 |
| 10.078125 | 5.2 |
| 10.0859375 | 2.7 |
| 10.09375 | 0.9 |
| 10.1015625 | 2.1 |
| 10.109375 | 2.4 |
| 10.1171875 | -2.3 |
| 10.125 | -8.7 |
| 10.1328125 | -10.8 |
| 10.140625 | -10.4 |
| 10.1484375 | -12.1 |
| 10.15625 | -15 |
| 10.1640625 | -13.2 |
| 10.171875 | -7.6 |
| 10.1796875 | -6.5 |
| 10.1875 | -10.5 |
| 10.1953125 | -11.7 |
| 10.203125 | -9.2 |
| 10.2109375 | -10.1 |
| 10.21875 | -12.8 |
| 10.2265625 | -8.3 |
| 10.234375 | -0.3 |
| 10.2421875 | 4.7 |
| 10.25 | 7.7 |
| 10.2578125 | 7.4 |
| 10.265625 | 9 |
| 10.2734375 | 17.5 |
| 10.28125 | 24.4 |
| 10.2890625 | 26.8 |
| 10.296875 | 28.3 |
| 10.3046875 | 30.5 |
| 10.3125 | 31.9 |
| 10.3203125 | 21.5 |
| 10.328125 | 2.3 |
| 10.3359375 | -6.3 |
| 10.34375 | -5.9 |
| 10.3515625 | -9.6 |
| 10.359375 | -18.5 |
| 10.3671875 | -30.7 |
| 10.375 | -39.5 |
| 10.3828125 | -39.6 |
| 10.390625 | -37.4 |
| 10.3984375 | -33.8 |
| 10.40625 | -24 |
| 10.4140625 | -16.4 |
| 10.421875 | -15 |
| 10.4296875 | -9.4 |
| 10.4375 | -1.3 |
| 10.4453125 | 2.4 |
| 10.453125 | 3.5 |
| 10.4609375 | -1.3 |
| 10.46875 | -9 |
| 10.4765625 | -12.6 |
| 10.484375 | -18.1 |
| 10.4921875 | -21 |
| 10.5 | -17.2 |
| 10.5078125 | -22.5 |
| 10.515625 | -32 |
| 10.5234375 | -28.1 |
| 10.53125 | -19.6 |
| 10.5390625 | -14.6 |
| 10.546875 | -5.9 |
| 10.5546875 | 3.3 |
| 10.5625 | 6 |
| 10.5703125 | 7.9 |
| 10.578125 | 13.1 |
| 10.5859375 | 16.8 |
| 10.59375 | 18.8 |
| 10.6015625 | 20.8 |
| 10.609375 | 20 |
| 10.6171875 | 18.4 |
| 10.625 | 18 |
| 10.6328125 | 16.7 |
| 10.640625 | 18.9 |
| 10.6484375 | 24.5 |
| 10.65625 | 25.8 |
| 10.6640625 | 25.4 |
| 10.671875 | 31 |
| 10.6796875 | 39.1 |
| 10.6875 | 41.8 |
| 10.6953125 | 41.9 |
| 10.703125 | 38.3 |
| 10.7109375 | 25.1 |
| 10.71875 | 12.5 |
| 10.7265625 | 3.8 |
| 10.734375 | -10 |
| 10.7421875 | -17.7 |
| 10.75 | -18.2 |
| 10.7578125 | -26.1 |
| 10.765625 | -27.4 |
| 10.7734375 | -18.1 |
| 10.78125 | -15.6 |
| 10.7890625 | -11 |
| 10.796875 | 4.5 |
| 10.8046875 | 20.1 |
| 10.8125 | 31.2 |
| 10.8203125 | 34.9 |
| 10.828125 | 31.6 |
| 10.8359375 | 26.4 |
| 10.84375 | 22 |
| 10.8515625 | 21.2 |
| 10.859375 | 17.5 |
| 10.8671875 | 6.4 |
| 10.875 | -1.6 |
| 10.8828125 | -3.4 |
| 10.890625 | -6 |
| 10.8984375 | -13 |
| 10.90625 | -19.8 |
| 10.9140625 | -19 |
| 10.921875 | -18 |
| 10.9296875 | -18 |
| 10.9375 | -9.2 |
| 10.9453125 | -3 |
| 10.953125 | -4.4 |
| 10.9609375 | -3.7 |
| 10.96875 | -8.5 |
| 10.9765625 | -17.3 |
| 10.984375 | -18.4 |
| 10.9921875 | -21.4 |
| 11.0 | -29.3 |
| 11.0078125 | -28.8 |
| 11.015625 | -19.7 |
| 11.0234375 | -13.9 |
| 11.03125 | -17.2 |
| 11.0390625 | -25.7 |
| 11.046875 | -34.1 |
| 11.0546875 | -35.2 |
| 11.0625 | -27.9 |
| 11.0703125 | -23.4 |
| 11.078125 | -22.6 |
| 11.0859375 | -20.2 |
| 11.09375 | -19.5 |
| 11.1015625 | -12.4 |
| 11.109375 | 1.1 |
| 11.1171875 | 1.4 |
| 11.125 | -3.9 |
| 11.1328125 | 2.1 |
| 11.140625 | 9.4 |
| 11.1484375 | 16 |
| 11.15625 | 23.7 |
| 11.1640625 | 19.1 |
| 11.171875 | 8.3 |
| 11.1796875 | 2.3 |
| 11.1875 | -5.8 |
| 11.1953125 | -7.5 |
| 11.203125 | -0.4 |
| 11.2109375 | -3.6 |
| 11.21875 | -7.6 |
| 11.2265625 | -1.9 |
| 11.234375 | -3.5 |
| 11.2421875 | -8.2 |
| 11.25 | -7.8 |
| 11.2578125 | -10 |
| 11.265625 | -8.7 |
| 11.2734375 | -5.3 |
| 11.28125 | -5 |
| 11.2890625 | 3.4 |
| 11.296875 | 10.8 |
| 11.3046875 | 8.6 |
| 11.3125 | 7.9 |
| 11.3203125 | 1 |
| 11.328125 | -10.3 |
| 11.3359375 | -12.5 |
| 11.34375 | -15.2 |
| 11.3515625 | -11.7 |
| 11.359375 | 7.1 |
| 11.3671875 | 20.2 |
| 11.375 | 25.4 |
| 11.3828125 | 30.2 |
| 11.390625 | 29.2 |
| 11.3984375 | 26.6 |
| 11.40625 | 19.1 |
| 11.4140625 | 5.9 |
| 11.421875 | 3.6 |
| 11.4296875 | 10.2 |
| 11.4375 | 18.2 |
| 11.4453125 | 28.3 |
| 11.453125 | 31 |
| 11.4609375 | 26.9 |
| 11.46875 | 20.8 |
| 11.4765625 | 4.5 |
| 11.484375 | -16.4 |
| 11.4921875 | -30 |
| 11.5 | -32 |
| 11.5078125 | -23.7 |
| 11.515625 | -19.5 |
| 11.5234375 | -17.8 |
| 11.53125 | -5.6 |
| 11.5390625 | 0.8 |
| 11.546875 | -5.9 |
| 11.5546875 | -13.4 |
| 11.5625 | -26.8 |
| 11.5703125 | -34.1 |
| 11.578125 | -22 |
| 11.5859375 | -17.8 |
| 11.59375 | -19.9 |
| 11.6015625 | 0.4 |
| 11.609375 | 24.4 |
| 11.6171875 | 31.3 |
| 11.625 | 32.5 |
| 11.6328125 | 24.9 |
| 11.640625 | 6 |
| 11.6484375 | -5.2 |
| 11.65625 | -6.5 |
| 11.6640625 | -11 |
| 11.671875 | -12.1 |
| 11.6796875 | -1.6 |
| 11.6875 | 8.5 |
| 11.6953125 | 11.8 |
| 11.703125 | 5.9 |
| 11.7109375 | -13.4 |
| 11.71875 | -31 |
| 11.7265625 | -38.2 |
| 11.734375 | -44.2 |
| 11.7421875 | -42.8 |
| 11.75 | -33.7 |
| 11.7578125 | -25.9 |
| 11.765625 | -15.7 |
| 11.7734375 | -10.4 |
| 11.78125 | -16.3 |
| 11.7890625 | -23.9 |
| 11.796875 | -36.7 |
| 11.8046875 | -53.1 |
| 11.8125 | -60.7 |
| 11.8203125 | -62.9 |
| 11.828125 | -59.1 |
| 11.8359375 | -42.2 |
| 11.84375 | -20.8 |
| 11.8515625 | -7.8 |
| 11.859375 | -5.5 |
| 11.8671875 | -5.2 |
| 11.875 | -5.6 |
| 11.8828125 | -15.9 |
| 11.890625 | -22.6 |
| 11.8984375 | -10.2 |
| 11.90625 | 3.2 |
| 11.9140625 | 9 |
| 11.921875 | 20.4 |
| 11.9296875 | 32.2 |
| 11.9375 | 33.5 |
| 11.9453125 | 26 |
| 11.953125 | 10.4 |
| 11.9609375 | -4.3 |
| 11.96875 | -2.7 |
| 11.9765625 | 11.6 |
| 11.984375 | 26 |
| 11.9921875 | 33.1 |
| 12.0 | 29 |
| 12.0078125 | 22.4 |
| 12.015625 | 24.7 |
| 12.0234375 | 26.9 |
| 12.03125 | 17.7 |
| 12.0390625 | 6.6 |
| 12.046875 | 4.8 |
| 12.0546875 | 5.9 |
| 12.0625 | 4 |
| 12.0703125 | 2.2 |
| 12.078125 | 1.8 |
| 12.0859375 | 4.2 |
| 12.09375 | 4.6 |
| 12.1015625 | -4.9 |
| 12.109375 | -14.3 |
| 12.1171875 | -17.6 |
| 12.125 | -26.9 |
| 12.1328125 | -36.9 |
| 12.140625 | -32.8 |
| 12.1484375 | -17.2 |
| 12.15625 | 2.7 |
| 12.1640625 | 18.8 |
| 12.171875 | 26.4 |
| 12.1796875 | 33.7 |
| 12.1875 | 43.3 |
| 12.1953125 | 43.9 |
| 12.203125 | 29.4 |
| 12.2109375 | 12.6 |
| 12.21875 | 10 |
| 12.2265625 | 12.9 |
| 12.234375 | 8.1 |
| 12.2421875 | 2.1 |
| 12.25 | 0.2 |
| 12.2578125 | 5.7 |
| 12.265625 | 13.5 |
| 12.2734375 | 4.3 |
| 12.28125 | -14.3 |
| 12.2890625 | -22.5 |
| 12.296875 | -25.4 |
| 12.3046875 | -25.7 |
| 12.3125 | -19.4 |
| 12.3203125 | -12.2 |
| 12.328125 | -6.3 |
| 12.3359375 | -0.9 |
| 12.34375 | 5.8 |
| 12.3515625 | 10 |
| 12.359375 | 4.6 |
| 12.3671875 | -3.7 |
| 12.375 | -12.4 |
| 12.3828125 | -21 |
| 12.390625 | -18 |
| 12.3984375 | -10.9 |
| 12.40625 | -5.8 |
| 12.4140625 | 6 |
| 12.421875 | 12.4 |
| 12.4296875 | 10 |
| 12.4375 | 10 |
| 12.4453125 | 2.6 |
| 12.453125 | -10.8 |
| 12.4609375 | -19 |
| 12.46875 | -24.3 |
| 12.4765625 | -21.2 |
| 12.484375 | -18.7 |
| 12.4921875 | -27.9 |
| 12.5 | -31.2 |
| 12.5078125 | -28 |
| 12.515625 | -30.5 |
| 12.5234375 | -31.8 |
| 12.53125 | -35.2 |
| 12.5390625 | -41.1 |
| 12.546875 | -38.7 |
| 12.5546875 | -36.3 |
| 12.5625 | -32.8 |
| 12.5703125 | -21.7 |
| 12.578125 | -15.9 |
| 12.5859375 | -12 |
| 12.59375 | -0.5 |
| 12.6015625 | 8.6 |
| 12.609375 | 15.6 |
| 12.6171875 | 20.7 |
| 12.625 | 18.3 |
| 12.6328125 | 18.4 |
| 12.640625 | 22.1 |
| 12.6484375 | 24.7 |
| 12.65625 | 30.7 |
| 12.6640625 | 33.9 |
| 12.671875 | 28.4 |
| 12.6796875 | 21.4 |
| 12.6875 | 17.8 |
| 12.6953125 | 20.7 |
| 12.703125 | 24.5 |
| 12.7109375 | 18.4 |
| 12.71875 | 8.3 |
| 12.7265625 | 7.2 |
| 12.734375 | 14 |
| 12.7421875 | 16.3 |
| 12.75 | 12 |
| 12.7578125 | 11.4 |
| 12.765625 | 13.8 |
| 12.7734375 | 15.1 |
| 12.78125 | 13.6 |
| 12.7890625 | 4.4 |
| 12.796875 | -3.6 |
| 12.8046875 | -6.2 |
| 12.8125 | -14 |
| 12.8203125 | -22.2 |
| 12.828125 | -27 |
| 12.8359375 | -28.9 |
| 12.84375 | -18 |
| 12.8515625 | -6.3 |
| 12.859375 | -4.8 |
| 12.8671875 | 1.4 |
| 12.875 | 9 |
| 12.8828125 | 11.9 |
| 12.890625 | 20 |
| 12.8984375 | 27.3 |
| 12.90625 | 29.8 |
| 12.9140625 | 31.4 |
| 12.921875 | 29.9 |
| 12.9296875 | 31.2 |
| 12.9375 | 34.5 |
| 12.9453125 | 31.7 |
| 12.953125 | 33.3 |
| 12.9609375 | 40.8 |
| 12.96875 | 40.2 |
| 12.9765625 | 35 |
| 12.984375 | 34.8 |
| 12.9921875 | 36.4 |
| 13.0 | 37.4 |
| 13.0078125 | 37.8 |
| 13.015625 | 35.7 |
| 13.0234375 | 33.3 |
| 13.03125 | 35.6 |
| 13.0390625 | 41.3 |
| 13.046875 | 45.7 |
| 13.0546875 | 48.3 |
| 13.0625 | 50.7 |
| 13.0703125 | 52.6 |
| 13.078125 | 50.7 |
| 13.0859375 | 44.8 |
| 13.09375 | 39.6 |
| 13.1015625 | 34.4 |
| 13.109375 | 29.1 |
| 13.1171875 | 27.4 |
| 13.125 | 23.8 |
| 13.1328125 | 12.7 |
| 13.140625 | 3.5 |
| 13.1484375 | 0.8 |
| 13.15625 | -2.8 |
| 13.1640625 | -4.9 |
| 13.171875 | -0.5 |
| 13.1796875 | 6.6 |
| 13.1875 | 14.5 |
| 13.1953125 | 17.3 |
| 13.203125 | 15.3 |
| 13.2109375 | 18.4 |
| 13.21875 | 14.9 |
| 13.2265625 | 3 |
| 13.234375 | 6.2 |
| 13.2421875 | 11.3 |
| 13.25 | 1.3 |
| 13.2578125 | -6.3 |
| 13.265625 | -10.7 |
| 13.2734375 | -16 |
| 13.28125 | -14.9 |
| 13.2890625 | -14.8 |
| 13.296875 | -14.9 |
| 13.3046875 | -9.9 |
| 13.3125 | -7.9 |
| 13.3203125 | -7.1 |
| 13.328125 | -7.1 |
| 13.3359375 | -13.4 |
| 13.34375 | -18.6 |
| 13.3515625 | -16.8 |
| 13.359375 | -15.8 |
| 13.3671875 | -26.6 |
| 13.375 | -39.5 |
| 13.3828125 | -36.8 |
| 13.390625 | -35.2 |
| 13.3984375 | -45.9 |
| 13.40625 | -49.3 |
| 13.4140625 | -45.7 |
| 13.421875 | -43.7 |
| 13.4296875 | -41 |
| 13.4375 | -42.1 |
| 13.4453125 | -39.7 |
| 13.453125 | -28.6 |
| 13.4609375 | -22.2 |
| 13.46875 | -20.3 |
| 13.4765625 | -20.7 |
| 13.484375 | -27 |
| 13.4921875 | -28 |
| 13.5 | -27.6 |
| 13.5078125 | -35.5 |
| 13.515625 | -35.5 |
| 13.5234375 | -26.3 |
| 13.53125 | -23.8 |
| 13.5390625 | -25.8 |
| 13.546875 | -29.1 |
| 13.5546875 | -28.3 |
| 13.5625 | -16.9 |
| 13.5703125 | -9.1 |
| 13.578125 | -8.8 |
| 13.5859375 | -6.6 |
| 13.59375 | -6.1 |
| 13.6015625 | -2.6 |
| 13.609375 | 4.9 |
| 13.6171875 | 3.3 |
| 13.625 | 2.4 |
| 13.6328125 | 8.1 |
| 13.640625 | 11.1 |
| 13.6484375 | 17.2 |
| 13.65625 | 19 |
| 13.6640625 | 9.1 |
| 13.671875 | 7.3 |
| 13.6796875 | 13.2 |
| 13.6875 | 16.4 |
| 13.6953125 | 17 |
| 13.703125 | 11 |
| 13.7109375 | 12.2 |
| 13.71875 | 23.6 |
| 13.7265625 | 24.4 |
| 13.734375 | 25.4 |
| 13.7421875 | 30.8 |
| 13.75 | 28.8 |
| 13.7578125 | 32.8 |
| 13.765625 | 34.7 |
| 13.7734375 | 29.3 |
| 13.78125 | 44.1 |
| 13.7890625 | 61.7 |
| 13.796875 | 59 |
| 13.8046875 | 59.5 |
| 13.8125 | 62.7 |
| 13.8203125 | 55.8 |
| 13.828125 | 48.8 |
| 13.8359375 | 44.7 |
| 13.84375 | 42.1 |
| 13.8515625 | 36.4 |
| 13.859375 | 24.3 |
| 13.8671875 | 17.7 |
| 13.875 | 15 |
| 13.8828125 | 4.7 |
| 13.890625 | -5.8 |
| 13.8984375 | -10.7 |
| 13.90625 | -16.3 |
| 13.9140625 | -21.4 |
| 13.921875 | -20.3 |
| 13.9296875 | -15.9 |
| 13.9375 | -13.7 |
| 13.9453125 | -12.5 |
| 13.953125 | -10.1 |
| 13.9609375 | -11 |
| 13.96875 | -13.5 |
| 13.9765625 | -8.9 |
| 13.984375 | -5.6 |
| 13.9921875 | -13.5 |
| 14.0 | -18.5 |
| 14.0078125 | -18.4 |
| 14.015625 | -23.9 |
| 14.0234375 | -24.8 |
| 14.03125 | -21.9 |
| 14.0390625 | -27.2 |
| 14.046875 | -29.5 |
| 14.0546875 | -24.4 |
| 14.0625 | -19 |
| 14.0703125 | -11.5 |
| 14.078125 | -5.6 |
| 14.0859375 | 0 |
| 14.09375 | 7.4 |
| 14.1015625 | 9.8 |
| 14.109375 | 13.8 |
| 14.1171875 | 19.2 |
| 14.125 | 17.1 |
| 14.1328125 | 15.8 |
| 14.140625 | 14.3 |
| 14.1484375 | 10.3 |
| 14.15625 | 13.6 |
| 14.1640625 | 12.1 |
| 14.171875 | 0.8 |
| 14.1796875 | -4 |
| 14.1875 | -5.8 |
| 14.1953125 | -10.8 |
| 14.203125 | -16 |
| 14.2109375 | -24.3 |
| 14.21875 | -31.4 |
| 14.2265625 | -35.4 |
| 14.234375 | -38 |
| 14.2421875 | -35.4 |
| 14.25 | -33.7 |
| 14.2578125 | -35.9 |
| 14.265625 | -36.4 |
| 14.2734375 | -36.9 |
| 14.28125 | -36 |
| 14.2890625 | -35.2 |
| 14.296875 | -40.5 |
| 14.3046875 | -42 |
| 14.3125 | -36.1 |
| 14.3203125 | -32.9 |
| 14.328125 | -33.8 |
| 14.3359375 | -39.2 |
| 14.34375 | -42.1 |
| 14.3515625 | -35.4 |
| 14.359375 | -34.6 |
| 14.3671875 | -41.5 |
| 14.375 | -35.5 |
| 14.3828125 | -21.7 |
| 14.390625 | -15.4 |
| 14.3984375 | -12.7 |
| 14.40625 | -11.2 |
| 14.4140625 | -13.1 |
| 14.421875 | -18.6 |
| 14.4296875 | -24.7 |
| 14.4375 | -24.2 |
| 14.4453125 | -20.5 |
| 14.453125 | -21.4 |
| 14.4609375 | -19.5 |
| 14.46875 | -11.8 |
| 14.4765625 | -6 |
| 14.484375 | -2.7 |
| 14.4921875 | -1.8 |
| 14.5 | -4.4 |
| 14.5078125 | -4.1 |
| 14.515625 | -1.1 |
| 14.5234375 | -2.9 |
| 14.53125 | -5.5 |
| 14.5390625 | -5 |
| 14.546875 | -10.5 |
| 14.5546875 | -18.8 |
| 14.5625 | -16.9 |
| 14.5703125 | -11.5 |
| 14.578125 | -10.1 |
| 14.5859375 | -8 |
| 14.59375 | -9.8 |
| 14.6015625 | -14 |
| 14.609375 | -13.3 |
| 14.6171875 | -15.9 |
| 14.625 | -19.6 |
| 14.6328125 | -11.9 |
| 14.640625 | -0.8 |
| 14.6484375 | 2.4 |
| 14.65625 | -0.6 |
| 14.6640625 | 2.8 |
| 14.671875 | 18.4 |
| 14.6796875 | 21.1 |
| 14.6875 | 7.2 |
| 14.6953125 | 10.9 |
| 14.703125 | 23.1 |
| 14.7109375 | 20 |
| 14.71875 | 21.7 |
| 14.7265625 | 29.5 |
| 14.734375 | 26.7 |
| 14.7421875 | 23.5 |
| 14.75 | 20.1 |
| 14.7578125 | 12.2 |
| 14.765625 | 11.5 |
| 14.7734375 | 13.4 |
| 14.78125 | 9.3 |
| 14.7890625 | 6.6 |
| 14.796875 | 3.8 |
| 14.8046875 | -2.5 |
| 14.8125 | -1.2 |
| 14.8203125 | 4.8 |
| 14.828125 | 1.7 |
| 14.8359375 | 0.2 |
| 14.84375 | 10 |
| 14.8515625 | 13.7 |
| 14.859375 | 6.7 |
| 14.8671875 | 2 |
| 14.875 | 2.4 |
| 14.8828125 | 4.9 |
| 14.890625 | 4.5 |
| 14.8984375 | 3.9 |
| 14.90625 | 8.8 |
| 14.9140625 | 10 |
| 14.921875 | 9.5 |
| 14.9296875 | 11.6 |
| 14.9375 | 8.6 |
| 14.9453125 | 11.8 |
| 14.953125 | 20 |
| 14.9609375 | 14.1 |
| 14.96875 | 8.5 |
| 14.9765625 | 10.2 |
| 14.984375 | 6 |
| 14.9921875 | -0.5 |
| 15.0 | -3.5 |
| 15.0078125 | 2.4 |
| 15.015625 | 10.9 |
| 15.0234375 | 7.8 |
| 15.03125 | 7.6 |
| 15.0390625 | 12.7 |
| 15.046875 | 11.5 |
| 15.0546875 | 18.2 |
| 15.0625 | 27.9 |
| 15.0703125 | 26.1 |
| 15.078125 | 22.7 |
| 15.0859375 | 19.7 |
| 15.09375 | 18.6 |
| 15.1015625 | 19.1 |
| 15.109375 | 12.6 |
| 15.1171875 | 7.3 |
| 15.125 | 1.4 |
| 15.1328125 | -8.2 |
| 15.140625 | -6.4 |
| 15.1484375 | -2 |
| 15.15625 | -8 |
| 15.1640625 | -14.9 |
| 15.171875 | -17.2 |
| 15.1796875 | -11 |
| 15.1875 | -3.3 |
| 15.1953125 | -7.6 |
| 15.203125 | -10.1 |
| 15.2109375 | 1.8 |
| 15.21875 | 14 |
| 15.2265625 | 19.3 |
| 15.234375 | 23.8 |
| 15.2421875 | 27.7 |
| 15.25 | 28.6 |
| 15.2578125 | 26.6 |
| 15.265625 | 20.1 |
| 15.2734375 | 15.7 |
| 15.28125 | 16 |
| 15.2890625 | 11.1 |
| 15.296875 | 9.3 |
| 15.3046875 | 17.6 |
| 15.3125 | 17.8 |
| 15.3203125 | 10.6 |
| 15.328125 | 7 |
| 15.3359375 | 4.7 |
| 15.34375 | 3.1 |
| 15.3515625 | -3.7 |
| 15.359375 | -9.9 |
| 15.3671875 | -1.4 |
| 15.375 | 4.9 |
| 15.3828125 | -1 |
| 15.390625 | -4.2 |
| 15.3984375 | -2.8 |
| 15.40625 | -0.7 |
| 15.4140625 | -2 |
| 15.421875 | -6.6 |
| 15.4296875 | -7.2 |
| 15.4375 | -11.6 |
| 15.4453125 | -18.3 |
| 15.453125 | -14 |
| 15.4609375 | -10.6 |
| 15.46875 | -16.3 |
| 15.4765625 | -16.7 |
| 15.484375 | -7.6 |
| 15.4921875 | 4.1 |
| 15.5 | 13.8 |
| 15.5078125 | 17.8 |
| 15.515625 | 21.1 |
| 15.5234375 | 31.6 |
| 15.53125 | 40.1 |
| 15.5390625 | 38.2 |
| 15.546875 | 36.1 |
| 15.5546875 | 35.7 |
| 15.5625 | 35.5 |
| 15.5703125 | 43.5 |
| 15.578125 | 47.6 |
| 15.5859375 | 40 |
| 15.59375 | 33.8 |
| 15.6015625 | 26.4 |
| 15.609375 | 21.8 |
| 15.6171875 | 26.9 |
| 15.625 | 23.1 |
| 15.6328125 | 13.8 |
| 15.640625 | 11.8 |
| 15.6484375 | 7.1 |
| 15.65625 | 4.7 |
| 15.6640625 | 5.9 |
| 15.671875 | -0.7 |
| 15.6796875 | -7.6 |
| 15.6875 | -10.5 |
| 15.6953125 | -12.3 |
| 15.703125 | -13.9 |
| 15.7109375 | -20.1 |
| 15.71875 | -24 |
| 15.7265625 | -23.4 |
| 15.734375 | -23.6 |
| 15.7421875 | -19.8 |
| 15.75 | -17.1 |
| 15.7578125 | -18.4 |
| 15.765625 | -15.9 |
| 15.7734375 | -16.4 |
| 15.78125 | -17.5 |
| 15.7890625 | -14.9 |
| 15.796875 | -22.6 |
| 15.8046875 | -29.8 |
| 15.8125 | -22.6 |
| 15.8203125 | -20.8 |
| 15.828125 | -27.3 |
| 15.8359375 | -28.7 |
| 15.84375 | -31.2 |
| 15.8515625 | -34.7 |
| 15.859375 | -32.6 |
| 15.8671875 | -32.3 |
| 15.875 | -32.7 |
| 15.8828125 | -28.1 |
| 15.890625 | -21.6 |
| 15.8984375 | -13.3 |
| 15.90625 | -6.6 |
| 15.9140625 | -2.3 |
| 15.921875 | 3.2 |
| 15.9296875 | 1.8 |
| 15.9375 | -3 |
| 15.9453125 | -2.4 |
| 15.953125 | -11.7 |
| 15.9609375 | -27.8 |
| 15.96875 | -30.7 |
| 15.9765625 | -27.1 |
| 15.984375 | -26.9 |
| 15.9921875 | -28 |
| 16.0 | -28.4 |
| 16.0078125 | -23.5 |
| 16.015625 | -15.4 |
| 16.0234375 | -7.6 |
| 16.03125 | -2.2 |
| 16.0390625 | -3.8 |
| 16.046875 | -4 |
| 16.0546875 | 3.4 |
| 16.0625 | 7.9 |
| 16.0703125 | 8.8 |
| 16.078125 | 13.3 |
| 16.0859375 | 18.6 |
| 16.09375 | 21.5 |
| 16.1015625 | 22.6 |
| 16.109375 | 19.9 |
| 16.1171875 | 12.8 |
| 16.125 | 4.9 |
| 16.1328125 | -2 |
| 16.140625 | -8.4 |
| 16.1484375 | -14 |
| 16.15625 | -18.2 |
| 16.1640625 | -14.5 |
| 16.171875 | -1.3 |
| 16.1796875 | 10.4 |
| 16.1875 | 14.8 |
| 16.1953125 | 8.4 |
| 16.203125 | -5.5 |
| 16.2109375 | -6 |
| 16.21875 | 3.2 |
| 16.2265625 | 1.5 |
| 16.234375 | -0.7 |
| 16.2421875 | 7.2 |
| 16.25 | 16.5 |
| 16.2578125 | 21.2 |
| 16.265625 | 18.5 |
| 16.2734375 | 11.9 |
| 16.28125 | 6 |
| 16.2890625 | 1.1 |
| 16.296875 | 1.5 |
| 16.3046875 | 6.2 |
| 16.3125 | 13.9 |
| 16.3203125 | 21.3 |
| 16.328125 | 19.8 |
| 16.3359375 | 21.2 |
| 16.34375 | 31.3 |
| 16.3515625 | 29.4 |
| 16.359375 | 20.7 |
| 16.3671875 | 21.8 |
| 16.375 | 27 |
| 16.3828125 | 33.8 |
| 16.390625 | 42.5 |
| 16.3984375 | 48.4 |
| 16.40625 | 49.8 |
| 16.4140625 | 46.9 |
| 16.421875 | 45.1 |
| 16.4296875 | 43.3 |
| 16.4375 | 37.9 |
| 16.4453125 | 35.7 |
| 16.453125 | 32.6 |
| 16.4609375 | 26 |
| 16.46875 | 24.5 |
| 16.4765625 | 23.6 |
| 16.484375 | 22 |
| 16.4921875 | 26.2 |
| 16.5 | 29.2 |
| 16.5078125 | 26 |
| 16.515625 | 18.4 |
| 16.5234375 | 11.7 |
| 16.53125 | 5.9 |
| 16.5390625 | -9.4 |
| 16.546875 | -20.9 |
| 16.5546875 | -18.2 |
| 16.5625 | -23.8 |
| 16.5703125 | -28.4 |
| 16.578125 | -19.7 |
| 16.5859375 | -23.7 |
| 16.59375 | -28.4 |
| 16.6015625 | -15.7 |
| 16.609375 | -13.1 |
| 16.6171875 | -15.1 |
| 16.625 | -4.7 |
| 16.6328125 | -2.1 |
| 16.640625 | -6 |
| 16.6484375 | -7.4 |
| 16.65625 | -13.2 |
| 16.6640625 | -15.8 |
| 16.671875 | -16.8 |
| 16.6796875 | -19.1 |
| 16.6875 | -11.3 |
| 16.6953125 | -6.5 |
| 16.703125 | -8.8 |
| 16.7109375 | -3.1 |
| 16.71875 | -2.5 |
| 16.7265625 | -8.8 |
| 16.734375 | -6 |
| 16.7421875 | -6.4 |
| 16.75 | -12.1 |
| 16.7578125 | -10.5 |
| 16.765625 | -10.8 |
| 16.7734375 | -15.2 |
| 16.78125 | -17.3 |
| 16.7890625 | -20.8 |
| 16.796875 | -19 |
| 16.8046875 | -10.9 |
| 16.8125 | -9.1 |
| 16.8203125 | -10 |
| 16.828125 | -6.9 |
| 16.8359375 | -5.4 |
| 16.84375 | -6 |
| 16.8515625 | -9.6 |
| 16.859375 | -17.7 |
| 16.8671875 | -23.9 |
| 16.875 | -29 |
| 16.8828125 | -36.1 |
| 16.890625 | -39.8 |
| 16.8984375 | -43.3 |
| 16.90625 | -50.5 |
| 16.9140625 | -49.2 |
| 16.921875 | -40.3 |
| 16.9296875 | -39.8 |
| 16.9375 | -44.6 |
| 16.9453125 | -45.4 |
| 16.953125 | -45 |
| 16.9609375 | -41.5 |
| 16.96875 | -34.3 |
| 16.9765625 | -29.4 |
| 16.984375 | -24.3 |
| 16.9921875 | -15.8 |
| 17.0 | -8.8 |
| 17.0078125 | -8.4 |
| 17.015625 | -10.2 |
| 17.0234375 | -5.3 |
| 17.03125 | -1.9 |
| 17.0390625 | -4.8 |
| 17.046875 | 2.1 |
| 17.0546875 | 11.7 |
| 17.0625 | 9.9 |
| 17.0703125 | 13.5 |
| 17.078125 | 20.5 |
| 17.0859375 | 17.5 |
| 17.09375 | 16.3 |
| 17.1015625 | 13.9 |
| 17.109375 | 6.4 |
| 17.1171875 | 7.7 |
| 17.125 | 7.4 |
| 17.1328125 | 0.9 |
| 17.140625 | 8 |
| 17.1484375 | 15.8 |
| 17.15625 | 5.3 |
| 17.1640625 | -5.1 |
| 17.171875 | -5.6 |
| 17.1796875 | -9.7 |
| 17.1875 | -15.8 |
| 17.1953125 | -14.9 |
| 17.203125 | -11.9 |
| 17.2109375 | -9.3 |
| 17.21875 | -4.6 |
| 17.2265625 | -1.5 |
| 17.234375 | 1.9 |
| 17.2421875 | 6 |
| 17.25 | 5.9 |
| 17.2578125 | 8.8 |
| 17.265625 | 13.9 |
| 17.2734375 | 14.8 |
| 17.28125 | 23.6 |
| 17.2890625 | 37.2 |
| 17.296875 | 40.4 |
| 17.3046875 | 41.4 |
| 17.3125 | 41.4 |
| 17.3203125 | 39.7 |
| 17.328125 | 44.3 |
| 17.3359375 | 45.8 |
| 17.34375 | 45.2 |
| 17.3515625 | 51.1 |
| 17.359375 | 48.4 |
| 17.3671875 | 40.6 |
| 17.375 | 41 |
| 17.3828125 | 38 |
| 17.390625 | 30.3 |
| 17.3984375 | 24.6 |
| 17.40625 | 19.7 |
| 17.4140625 | 18.1 |
| 17.421875 | 14.1 |
| 17.4296875 | 8.5 |
| 17.4375 | 12 |
| 17.4453125 | 17.6 |
| 17.453125 | 17.9 |
| 17.4609375 | 12.3 |
| 17.46875 | 3.4 |
| 17.4765625 | 1 |
| 17.484375 | -1.9 |
| 17.4921875 | -11.8 |
| 17.5 | -12.9 |
| 17.5078125 | -7.2 |
| 17.515625 | -8.8 |
| 17.5234375 | -13.5 |
| 17.53125 | -14.7 |
| 17.5390625 | -8.1 |
| 17.546875 | 0.4 |
| 17.5546875 | 0.2 |
| 17.5625 | 0 |
| 17.5703125 | 5.6 |
| 17.578125 | 7.3 |
| 17.5859375 | 4.5 |
| 17.59375 | 1.6 |
| 17.6015625 | -1 |
| 17.609375 | -0.2 |
| 17.6171875 | 7.3 |
| 17.625 | 14.3 |
| 17.6328125 | 10.8 |
| 17.640625 | 5.2 |
| 17.6484375 | 10.8 |
| 17.65625 | 18.5 |
| 17.6640625 | 16.3 |
| 17.671875 | 9.4 |
| 17.6796875 | 6.6 |
| 17.6875 | 7.5 |
| 17.6953125 | 8.4 |
| 17.703125 | 10.3 |
| 17.7109375 | 8.5 |
| 17.71875 | -3.9 |
| 17.7265625 | -10.3 |
| 17.734375 | 0.8 |
| 17.7421875 | 11.3 |
| 17.75 | 11 |
| 17.7578125 | 6.9 |
| 17.765625 | 4.4 |
| 17.7734375 | 6.3 |
| 17.78125 | 4.5 |
| 17.7890625 | -1.6 |
| 17.796875 | -0.6 |
| 17.8046875 | -2.3 |
| 17.8125 | -9.8 |
| 17.8203125 | -9 |
| 17.828125 | -12.7 |
| 17.8359375 | -22.6 |
| 17.84375 | -19.5 |
| 17.8515625 | -18.1 |
| 17.859375 | -26.5 |
| 17.8671875 | -28.3 |
| 17.875 | -30.3 |
| 17.8828125 | -32.6 |
| 17.890625 | -27.3 |
| 17.8984375 | -28.3 |
| 17.90625 | -34.1 |
| 17.9140625 | -32.7 |
| 17.921875 | -32 |
| 17.9296875 | -32.1 |
| 17.9375 | -28.7 |
| 17.9453125 | -32.9 |
| 17.953125 | -44.7 |
| 17.9609375 | -49.2 |
| 17.96875 | -46.6 |
| 17.9765625 | -45.6 |
| 17.984375 | -43.2 |
| 17.9921875 | -40.9 |
| 18.0 | -41.3 |
| 18.0078125 | -34.5 |
| 18.015625 | -28.6 |
| 18.0234375 | -32 |
| 18.03125 | -29.2 |
| 18.0390625 | -21 |
| 18.046875 | -16.5 |
| 18.0546875 | -12.4 |
| 18.0625 | -12.5 |
| 18.0703125 | -12.5 |
| 18.078125 | -11.1 |
| 18.0859375 | -15.3 |
| 18.09375 | -9.1 |
| 18.1015625 | 5.2 |
| 18.109375 | 8.4 |
| 18.1171875 | 14.6 |
| 18.125 | 26.4 |
| 18.1328125 | 32 |
| 18.140625 | 40.7 |
| 18.1484375 | 43.2 |
| 18.15625 | 29.6 |
| 18.1640625 | 21.2 |
| 18.171875 | 18.7 |
| 18.1796875 | 9.1 |
| 18.1875 | 5 |
| 18.1953125 | 8.7 |
| 18.203125 | 2.9 |
| 18.2109375 | -4 |
| 18.21875 | 1.4 |
| 18.2265625 | 2.7 |
| 18.234375 | -5.5 |
| 18.2421875 | -6.7 |
| 18.25 | -4.3 |
| 18.2578125 | -6 |
| 18.265625 | -4.3 |
| 18.2734375 | -1.3 |
| 18.28125 | 1.3 |
| 18.2890625 | 5 |
| 18.296875 | 1.1 |
| 18.3046875 | -5.9 |
| 18.3125 | -6.3 |
| 18.3203125 | -10.6 |
| 18.328125 | -16.9 |
| 18.3359375 | -14.9 |
| 18.34375 | -12.9 |
| 18.3515625 | -10.5 |
| 18.359375 | -4 |
| 18.3671875 | -5.9 |
| 18.375 | -7.5 |
| 18.3828125 | 1.7 |
| 18.390625 | 3.7 |
| 18.3984375 | -0.7 |
| 18.40625 | 3.9 |
| 18.4140625 | 9.8 |
| 18.421875 | 13 |
| 18.4296875 | 15.4 |
| 18.4375 | 10.1 |
| 18.4453125 | 0.4 |
| 18.453125 | -4.5 |
| 18.4609375 | -1.5 |
| 18.46875 | 2.8 |
| 18.4765625 | -2.4 |
| 18.484375 | -9.6 |
| 18.4921875 | -11.6 |
| 18.5 | -17.5 |
| 18.5078125 | -21.1 |
| 18.515625 | -17.4 |
| 18.5234375 | -19.1 |
| 18.53125 | -20.7 |
| 18.5390625 | -14.5 |
| 18.546875 | -12.6 |
| 18.5546875 | -17.2 |
| 18.5625 | -19.6 |
| 18.5703125 | -21.2 |
| 18.578125 | -25.7 |
| 18.5859375 | -27.3 |
| 18.59375 | -20 |
| 18.6015625 | -7.9 |
| 18.609375 | 1.8 |
| 18.6171875 | 7.8 |
| 18.625 | 11.7 |
| 18.6328125 | 16.7 |
| 18.640625 | 21.2 |
| 18.6484375 | 19.8 |
| 18.65625 | 15.5 |
| 18.6640625 | 14.8 |
| 18.671875 | 16.3 |
| 18.6796875 | 13 |
| 18.6875 | 8.5 |
| 18.6953125 | 12.1 |
| 18.703125 | 14.4 |
| 18.7109375 | 10 |
| 18.71875 | 10.3 |
| 18.7265625 | 5.7 |
| 18.734375 | -8.5 |
| 18.7421875 | -12.8 |
| 18.75 | -13.4 |
| 18.7578125 | -20.4 |
| 18.765625 | -25.8 |
| 18.7734375 | -36.4 |
| 18.78125 | -47.1 |
| 18.7890625 | -46.5 |
| 18.796875 | -48.8 |
| 18.8046875 | -54.2 |
| 18.8125 | -54 |
| 18.8203125 | -53.5 |
| 18.828125 | -49.1 |
| 18.8359375 | -41.2 |
| 18.84375 | -36.1 |
| 18.8515625 | -31.9 |
| 18.859375 | -33.6 |
| 18.8671875 | -31.7 |
| 18.875 | -14 |
| 18.8828125 | -1.2 |
| 18.890625 | 4.9 |
| 18.8984375 | 18.4 |
| 18.90625 | 25 |
| 18.9140625 | 22.7 |
| 18.921875 | 19.6 |
| 18.9296875 | 11 |
| 18.9375 | 9.8 |
| 18.9453125 | 15.4 |
| 18.953125 | 12.6 |
| 18.9609375 | 16.2 |
| 18.96875 | 23 |
| 18.9765625 | 17.6 |
| 18.984375 | 19.1 |
| 18.9921875 | 27.4 |
| 19.0 | 26.1 |
| 19.0078125 | 25.4 |
| 19.015625 | 27.6 |
| 19.0234375 | 30.7 |
| 19.03125 | 35.3 |
| 19.0390625 | 34.3 |
| 19.046875 | 38.4 |
| 19.0546875 | 47.1 |
| 19.0625 | 41.6 |
| 19.0703125 | 37 |
| 19.078125 | 40.7 |
| 19.0859375 | 35.7 |
| 19.09375 | 32.2 |
| 19.1015625 | 37.1 |
| 19.109375 | 38.8 |
| 19.1171875 | 38.1 |
| 19.125 | 41.8 |
| 19.1328125 | 54.4 |
| 19.140625 | 63.5 |
| 19.1484375 | 57 |
| 19.15625 | 50.6 |
| 19.1640625 | 47.2 |
| 19.171875 | 39.3 |
| 19.1796875 | 36.8 |
| 19.1875 | 32.2 |
| 19.1953125 | 21.6 |
| 19.203125 | 23.2 |
| 19.2109375 | 32.9 |
| 19.21875 | 39.1 |
| 19.2265625 | 37.8 |
| 19.234375 | 27.7 |
| 19.2421875 | 23.1 |
| 19.25 | 25.5 |
| 19.2578125 | 21.7 |
| 19.265625 | 17.7 |
| 19.2734375 | 18.5 |
| 19.28125 | 16.2 |
| 19.2890625 | 10.9 |
| 19.296875 | 8.5 |
| 19.3046875 | 13.3 |
| 19.3125 | 17.6 |
| 19.3203125 | 18.3 |
| 19.328125 | 24.9 |
| 19.3359375 | 30.6 |
| 19.34375 | 27.7 |
| 19.3515625 | 27.7 |
| 19.359375 | 29.6 |
| 19.3671875 | 28.5 |
| 19.375 | 32 |
| 19.3828125 | 38.3 |
| 19.390625 | 42.9 |
| 19.3984375 | 46.2 |
| 19.40625 | 42.8 |
| 19.4140625 | 37.6 |
| 19.421875 | 36.3 |
| 19.4296875 | 29.7 |
| 19.4375 | 20.3 |
| 19.4453125 | 14.8 |
| 19.453125 | 9.4 |
| 19.4609375 | 9.6 |
| 19.46875 | 12.7 |
| 19.4765625 | 9.1 |
| 19.484375 | 10.8 |
| 19.4921875 | 16.2 |
| 19.5 | 10.8 |
| 19.5078125 | 6.2 |
| 19.515625 | 7.2 |
| 19.5234375 | 3.5 |
| 19.53125 | -2.1 |
| 19.5390625 | -5.2 |
| 19.546875 | -7.1 |
| 19.5546875 | -10 |
| 19.5625 | -13.2 |
| 19.5703125 | -9.8 |
| 19.578125 | -7.1 |
| 19.5859375 | -15 |
| 19.59375 | -21.2 |
| 19.6015625 | -22.6 |
| 19.609375 | -26.6 |
| 19.6171875 | -21.7 |
| 19.625 | -5.7 |
| 19.6328125 | 2.4 |
| 19.640625 | -5 |
| 19.6484375 | -16.2 |
| 19.65625 | -20.3 |
| 19.6640625 | -22.1 |
| 19.671875 | -25 |
| 19.6796875 | -23.4 |
| 19.6875 | -24.9 |
| 19.6953125 | -29 |
| 19.703125 | -24.5 |
| 19.7109375 | -23.3 |
| 19.71875 | -25.4 |
| 19.7265625 | -15.6 |
| 19.734375 | -6.4 |
| 19.7421875 | -3.3 |
| 19.75 | 0.9 |
| 19.7578125 | 3.4 |
| 19.765625 | 8.2 |
| 19.7734375 | 5.5 |
| 19.78125 | -9.2 |
| 19.7890625 | -13.4 |
| 19.796875 | -10 |
| 19.8046875 | -11.4 |
| 19.8125 | -9 |
| 19.8203125 | -5.1 |
| 19.828125 | -2.6 |
| 19.8359375 | -1.7 |
| 19.84375 | -6.9 |
| 19.8515625 | -11.2 |
| 19.859375 | -11.6 |
| 19.8671875 | -11.5 |
| 19.875 | -9.8 |
| 19.8828125 | -6.4 |
| 19.890625 | 0.7 |
| 19.8984375 | 4.8 |
| 19.90625 | 1.9 |
| 19.9140625 | 3 |
| 19.921875 | 7.3 |
| 19.9296875 | 10.4 |
| 19.9375 | 15.5 |
| 19.9453125 | 17.7 |
| 19.953125 | 16 |
| 19.9609375 | 17.4 |
| 19.96875 | 22.8 |
| 19.9765625 | 29.8 |
| 19.984375 | 33.5 |
| 19.9921875 | 31 |
| 20.0 | 23.6 |
| 20.0078125 | 18.2 |
| 20.015625 | 17.3 |
| 20.0234375 | 12.4 |
| 20.03125 | 6.9 |
| 20.0390625 | 6.3 |
| 20.046875 | 0 |
| 20.0546875 | -7.8 |
| 20.0625 | -11.8 |
| 20.0703125 | -23.3 |
| 20.078125 | -38.9 |
| 20.0859375 | -54.3 |
| 20.09375 | -67.5 |
| 20.1015625 | -66.6 |
| 20.109375 | -62.5 |
| 20.1171875 | -65.6 |
| 20.125 | -56.9 |
| 20.1328125 | -41.7 |
| 20.140625 | -38.2 |
| 20.1484375 | -35.5 |
| 20.15625 | -31.3 |
| 20.1640625 | -30.5 |
| 20.171875 | -23.4 |
| 20.1796875 | -16.8 |
| 20.1875 | -18.7 |
| 20.1953125 | -16.5 |
| 20.203125 | -11.9 |
| 20.2109375 | -10.3 |
| 20.21875 | -8.2 |
| 20.2265625 | -16.7 |
| 20.234375 | -31 |
| 20.2421875 | -30.1 |
| 20.25 | -25.7 |
| 20.2578125 | -26.5 |
| 20.265625 | -17.9 |
| 20.2734375 | -7.8 |
| 20.28125 | -4 |
| 20.2890625 | 6 |
| 20.296875 | 19.2 |
| 20.3046875 | 26 |
| 20.3125 | 24.8 |
| 20.3203125 | 17.6 |
| 20.328125 | 13.9 |
| 20.3359375 | 15.1 |
| 20.34375 | 15 |
| 20.3515625 | 11.9 |
| 20.359375 | 4.8 |
| 20.3671875 | 3.3 |
| 20.375 | 6 |
| 20.3828125 | -5 |
| 20.390625 | -19.7 |
| 20.3984375 | -23.1 |
| 20.40625 | -24.3 |
| 20.4140625 | -26.6 |
| 20.421875 | -32.4 |
| 20.4296875 | -42.7 |
| 20.4375 | -43.7 |
| 20.4453125 | -36.8 |
| 20.453125 | -36.2 |
| 20.4609375 | -40.6 |
| 20.46875 | -41.3 |
| 20.4765625 | -38.9 |
| 20.484375 | -39.4 |
| 20.4921875 | -42.7 |
| 20.5 | -43.8 |
| 20.5078125 | -41.1 |
| 20.515625 | -35.4 |
| 20.5234375 | -34.4 |
| 20.53125 | -40.6 |
| 20.5390625 | -46.3 |
| 20.546875 | -50.7 |
| 20.5546875 | -54.7 |
| 20.5625 | -59 |
| 20.5703125 | -62.5 |
| 20.578125 | -56.1 |
| 20.5859375 | -47.8 |
| 20.59375 | -47.6 |
| 20.6015625 | -41.5 |
| 20.609375 | -31.8 |
| 20.6171875 | -28.2 |
| 20.625 | -20.2 |
| 20.6328125 | -10.9 |
| 20.640625 | -8.2 |
| 20.6484375 | -6.1 |
| 20.65625 | -3.1 |
| 20.6640625 | 2.4 |
| 20.671875 | 10.7 |
| 20.6796875 | 12.3 |
| 20.6875 | 8.1 |
| 20.6953125 | 8.7 |
| 20.703125 | 15.6 |
| 20.7109375 | 22.2 |
| 20.71875 | 26.3 |
| 20.7265625 | 29.7 |
| 20.734375 | 30.9 |
| 20.7421875 | 29.6 |
| 20.75 | 28.6 |
| 20.7578125 | 25.3 |
| 20.765625 | 22.2 |
| 20.7734375 | 26.2 |
| 20.78125 | 31.2 |
| 20.7890625 | 27.1 |
| 20.796875 | 16.2 |
| 20.8046875 | 7.6 |
| 20.8125 | 3.8 |
| 20.8203125 | 3.8 |
| 20.828125 | 7.5 |
| 20.8359375 | 5.1 |
| 20.84375 | -8.3 |
| 20.8515625 | -15.2 |
| 20.859375 | -11.1 |
| 20.8671875 | -15.1 |
| 20.875 | -22.2 |
| 20.8828125 | -18.5 |
| 20.890625 | -19.2 |
| 20.8984375 | -27.9 |
| 20.90625 | -25.5 |
| 20.9140625 | -21 |
| 20.921875 | -25.2 |
| 20.9296875 | -18.4 |
| 20.9375 | -1.8 |
| 20.9453125 | 2.8 |
| 20.953125 | 2.6 |
| 20.9609375 | 8.5 |
| 20.96875 | 10.3 |
| 20.9765625 | 8.8 |
| 20.984375 | 15.6 |
| 20.9921875 | 28.7 |
| 21.0 | 36.8 |
| 21.0078125 | 37 |
| 21.015625 | 37.7 |
| 21.0234375 | 39.8 |
| 21.03125 | 35 |
| 21.0390625 | 27.7 |
| 21.046875 | 29.4 |
| 21.0546875 | 32.8 |
| 21.0625 | 27.7 |
| 21.0703125 | 21.3 |
| 21.078125 | 15.2 |
| 21.0859375 | 5.6 |
| 21.09375 | 3.8 |
| 21.1015625 | 9.1 |
| 21.109375 | 6.6 |
| 21.1171875 | 4.1 |
| 21.125 | 6.4 |
| 21.1328125 | 1.3 |
| 21.140625 | -0.7 |
| 21.1484375 | 8.1 |
| 21.15625 | 14.4 |
| 21.1640625 | 18 |
| 21.171875 | 19.3 |
| 21.1796875 | 14.7 |
| 21.1875 | 13.7 |
| 21.1953125 | 15.7 |
| 21.203125 | 18.7 |
| 21.2109375 | 27.8 |
| 21.21875 | 30.1 |
| 21.2265625 | 25 |
| 21.234375 | 28.5 |
| 21.2421875 | 32.1 |
| 21.25 | 27 |
| 21.2578125 | 22.5 |
| 21.265625 | 20.2 |
| 21.2734375 | 19.8 |
| 21.28125 | 23.2 |
| 21.2890625 | 24.8 |
| 21.296875 | 23.4 |
| 21.3046875 | 22.1 |
| 21.3125 | 18.4 |
| 21.3203125 | 15 |
| 21.328125 | 18.7 |
| 21.3359375 | 24.1 |
| 21.34375 | 24.3 |
| 21.3515625 | 25 |
| 21.359375 | 26.4 |
| 21.3671875 | 24.8 |
| 21.375 | 21.1 |
| 21.3828125 | 10.4 |
| 21.390625 | -2.6 |
| 21.3984375 | -1.8 |
| 21.40625 | 5.1 |
| 21.4140625 | 2.1 |
| 21.421875 | -1.1 |
| 21.4296875 | 4.2 |
| 21.4375 | 7.2 |
| 21.4453125 | 1 |
| 21.453125 | -3.6 |
| 21.4609375 | 1.7 |
| 21.46875 | 5.9 |
| 21.4765625 | 4.9 |
| 21.484375 | 8.8 |
| 21.4921875 | 10.5 |
| 21.5 | 5.1 |
| 21.5078125 | 4.3 |
| 21.515625 | 2.3 |
| 21.5234375 | -5.2 |
| 21.53125 | -3.5 |
| 21.5390625 | -0.2 |
| 21.546875 | -9.5 |
| 21.5546875 | -20.5 |
| 21.5625 | -24.1 |
| 21.5703125 | -25.2 |
| 21.578125 | -28.1 |
| 21.5859375 | -30.5 |
| 21.59375 | -28.4 |
| 21.6015625 | -28.3 |
| 21.609375 | -32.3 |
| 21.6171875 | -32 |
| 21.625 | -31.4 |
| 21.6328125 | -35 |
| 21.640625 | -34 |
| 21.6484375 | -32.7 |
| 21.65625 | -38.2 |
| 21.6640625 | -36.3 |
| 21.671875 | -23.6 |
| 21.6796875 | -16.8 |
| 21.6875 | -10.7 |
| 21.6953125 | 5.9 |
| 21.703125 | 16 |
| 21.7109375 | 11.9 |
| 21.71875 | 6.1 |
| 21.7265625 | -1.8 |
| 21.734375 | -4.6 |
| 21.7421875 | 4.7 |
| 21.75 | 7.1 |
| 21.7578125 | 1.4 |
| 21.765625 | 3.4 |
| 21.7734375 | 7.5 |
| 21.78125 | 10 |
| 21.7890625 | 9 |
| 21.796875 | 0 |
| 21.8046875 | -5.5 |
| 21.8125 | -7.6 |
| 21.8203125 | -13.2 |
| 21.828125 | -16.8 |
| 21.8359375 | -23.5 |
| 21.84375 | -26.5 |
| 21.8515625 | -16.7 |
| 21.859375 | -18.4 |
| 21.8671875 | -30.7 |
| 21.875 | -27.9 |
| 21.8828125 | -19.5 |
| 21.890625 | -12.2 |
| 21.8984375 | -1.7 |
| 21.90625 | 4.8 |
| 21.9140625 | 10.8 |
| 21.921875 | 13.7 |
| 21.9296875 | 11 |
| 21.9375 | 15.5 |
| 21.9453125 | 21.3 |
| 21.953125 | 26.9 |
| 21.9609375 | 44 |
| 21.96875 | 51.4 |
| 21.9765625 | 42 |
| 21.984375 | 42.6 |
| 21.9921875 | 48.8 |
| 22.0 | 49 |
| 22.0078125 | 53.5 |
| 22.015625 | 55.7 |
| 22.0234375 | 51.5 |
| 22.03125 | 51.4 |
| 22.0390625 | 50 |
| 22.046875 | 50.5 |
| 22.0546875 | 62.4 |
| 22.0625 | 66.6 |
| 22.0703125 | 59.5 |
| 22.078125 | 60.2 |
| 22.0859375 | 63.5 |
| 22.09375 | 63.8 |
| 22.1015625 | 59.2 |
| 22.109375 | 40.4 |
| 22.1171875 | 23.4 |
| 22.125 | 17.9 |
| 22.1328125 | 7.4 |
| 22.140625 | -4 |
| 22.1484375 | -11.5 |
| 22.15625 | -22 |
| 22.1640625 | -26.1 |
| 22.171875 | -24.3 |
| 22.1796875 | -27 |
| 22.1875 | -27.7 |
| 22.1953125 | -19.6 |
| 22.203125 | -5.3 |
| 22.2109375 | 0.3 |
| 22.21875 | -10.9 |
| 22.2265625 | -16.6 |
| 22.234375 | -8.2 |
| 22.2421875 | -4.4 |
| 22.25 | -9.9 |
| 22.2578125 | -20.1 |
| 22.265625 | -26.9 |
| 22.2734375 | -24.4 |
| 22.28125 | -24.4 |
| 22.2890625 | -24.9 |
| 22.296875 | -13.5 |
| 22.3046875 | -3.3 |
| 22.3125 | -0.3 |
| 22.3203125 | 5.5 |
| 22.328125 | 6.5 |
| 22.3359375 | 0 |
| 22.34375 | -2.2 |
| 22.3515625 | -0.9 |
| 22.359375 | -0.4 |
| 22.3671875 | 0.1 |
| 22.375 | -4.7 |
| 22.3828125 | -14.7 |
| 22.390625 | -21.2 |
| 22.3984375 | -20.8 |
| 22.40625 | -18.9 |
| 22.4140625 | -19.2 |
| 22.421875 | -14.9 |
| 22.4296875 | -4.2 |
| 22.4375 | 1.1 |
| 22.4453125 | 0.8 |
| 22.453125 | 1.5 |
| 22.4609375 | -1.2 |
| 22.46875 | -3.6 |
| 22.4765625 | -0.3 |
| 22.484375 | -0.5 |
| 22.4921875 | -3.6 |
| 22.5 | -1.2 |
| 22.5078125 | 2.3 |
| 22.515625 | 3.8 |
| 22.5234375 | 3.3 |
| 22.53125 | -0.5 |
| 22.5390625 | -4.2 |
| 22.546875 | -8.8 |
| 22.5546875 | -15.7 |
| 22.5625 | -18.6 |
| 22.5703125 | -19.5 |
| 22.578125 | -21.4 |
| 22.5859375 | -20.1 |
| 22.59375 | -18.8 |
| 22.6015625 | -17.4 |
| 22.609375 | -10.6 |
| 22.6171875 | -8.4 |
| 22.625 | -19.7 |
| 22.6328125 | -30.7 |
| 22.640625 | -31 |
| 22.6484375 | -29.5 |
| 22.65625 | -32 |
| 22.6640625 | -29.9 |
| 22.671875 | -24.1 |
| 22.6796875 | -22.9 |
| 22.6875 | -18.6 |
| 22.6953125 | -12 |
| 22.703125 | -16.5 |
| 22.7109375 | -21.5 |
| 22.71875 | -18.2 |
| 22.7265625 | -16.2 |
| 22.734375 | -13.1 |
| 22.7421875 | -11.6 |
| 22.75 | -19.3 |
| 22.7578125 | -22.1 |
| 22.765625 | -16.7 |
| 22.7734375 | -15.9 |
| 22.78125 | -13.2 |
| 22.7890625 | -6.6 |
| 22.796875 | -11.1 |
| 22.8046875 | -23.1 |
| 22.8125 | -27.2 |
| 22.8203125 | -25.2 |
| 22.828125 | -26.8 |
| 22.8359375 | -28.2 |
| 22.84375 | -21.6 |
| 22.8515625 | -15.8 |
| 22.859375 | -17.3 |
| 22.8671875 | -15.8 |
| 22.875 | -11.4 |
| 22.8828125 | -11.2 |
| 22.890625 | -10.5 |
| 22.8984375 | -8.2 |
| 22.90625 | -7.4 |
| 22.9140625 | -9.3 |
| 22.921875 | -14.1 |
| 22.9296875 | -13.9 |
| 22.9375 | -8.3 |
| 22.9453125 | -4.4 |
| 22.953125 | 1.5 |
| 22.9609375 | -0.4 |
| 22.96875 | -14 |
| 22.9765625 | -11.6 |
| 22.984375 | 1.6 |
| 22.9921875 | -0.4 |
| 23.0 | -4 |
| 23.0078125 | -1 |
| 23.015625 | -2.1 |
| 23.0234375 | -4.5 |
| 23.03125 | -7.9 |
| 23.0390625 | -5.3 |
| 23.046875 | 7.1 |
| 23.0546875 | 6.9 |
| 23.0625 | -5.3 |
| 23.0703125 | -8.6 |
| 23.078125 | -4.7 |
| 23.0859375 | 4.7 |
| 23.09375 | 13.5 |
| 23.1015625 | 9.8 |
| 23.109375 | 11.3 |
| 23.1171875 | 22.7 |
| 23.125 | 21.4 |
| 23.1328125 | 17.8 |
| 23.140625 | 23.3 |
| 23.1484375 | 22 |
| 23.15625 | 19.2 |
| 23.1640625 | 22.2 |
| 23.171875 | 18.9 |
| 23.1796875 | 13 |
| 23.1875 | 10.2 |
| 23.1953125 | 7.3 |
| 23.203125 | 8.2 |
| 23.2109375 | 6.4 |
| 23.21875 | -0.1 |
| 23.2265625 | 2.7 |
| 23.234375 | 9.5 |
| 23.2421875 | 10.8 |
| 23.25 | 9.5 |
| 23.2578125 | 2.9 |
| 23.265625 | 1.4 |
| 23.2734375 | 14.8 |
| 23.28125 | 27.5 |
| 23.2890625 | 31.6 |
| 23.296875 | 27.7 |
| 23.3046875 | 20.3 |
| 23.3125 | 21.4 |
| 23.3203125 | 19.9 |
| 23.328125 | 9.4 |
| 23.3359375 | 5.9 |
| 23.34375 | 5.3 |
| 23.3515625 | 6.9 |
| 23.359375 | 18 |
| 23.3671875 | 20.7 |
| 23.375 | 15.7 |
| 23.3828125 | 17.6 |
| 23.390625 | 21 |
| 23.3984375 | 26.1 |
| 23.40625 | 27.5 |
| 23.4140625 | 19.8 |
| 23.421875 | 21.3 |
| 23.4296875 | 30.8 |
| 23.4375 | 29.8 |
| 23.4453125 | 22.2 |
| 23.453125 | 16 |
| 23.4609375 | 11 |
| 23.46875 | 2.5 |
| 23.4765625 | -6.9 |
| 23.484375 | -8.8 |
| 23.4921875 | -14.1 |
| 23.5 | -24.7 |
| 23.5078125 | -21 |
| 23.515625 | -11.9 |
| 23.5234375 | -12.3 |
| 23.53125 | -11.2 |
| 23.5390625 | -5 |
| 23.546875 | -0.7 |
| 23.5546875 | -3.1 |
| 23.5625 | -9.3 |
| 23.5703125 | -6.8 |
| 23.578125 | -1 |
| 23.5859375 | -1.7 |
| 23.59375 | 3.5 |
| 23.6015625 | 12.6 |
| 23.609375 | 13.1 |
| 23.6171875 | 13.1 |
| 23.625 | 12 |
| 23.6328125 | 3.1 |
| 23.640625 | -5 |
| 23.6484375 | -6.2 |
| 23.65625 | 1.7 |
| 23.6640625 | 14.6 |
| 23.671875 | 22.1 |
| 23.6796875 | 28.6 |
| 23.6875 | 38.7 |
| 23.6953125 | 44.1 |
| 23.703125 | 38.7 |
| 23.7109375 | 23.5 |
| 23.71875 | 14.1 |
| 23.7265625 | 16.8 |
| 23.734375 | 18.1 |
| 23.7421875 | 24 |
| 23.75 | 36 |
| 23.7578125 | 39.3 |
| 23.765625 | 47.2 |
| 23.7734375 | 58.6 |
| 23.78125 | 48.6 |
| 23.7890625 | 34.8 |
| 23.796875 | 35 |
| 23.8046875 | 33.9 |
| 23.8125 | 31.9 |
| 23.8203125 | 32.4 |
| 23.828125 | 31.8 |
| 23.8359375 | 36.4 |
| 23.84375 | 39.3 |
| 23.8515625 | 26.9 |
| 23.859375 | 9.4 |
| 23.8671875 | -0.2 |
| 23.875 | -8.8 |
| 23.8828125 | -17.5 |
| 23.890625 | -16.3 |
| 23.8984375 | -15.1 |
| 23.90625 | -22.4 |
| 23.9140625 | -25.6 |
| 23.921875 | -27.5 |
| 23.9296875 | -34.4 |
| 23.9375 | -38.3 |
| 23.9453125 | -42.5 |
| 23.953125 | -44.4 |
| 23.9609375 | -40.3 |
| 23.96875 | -40.3 |
| 23.9765625 | -33.6 |
| 23.984375 | -17.2 |
| 23.9921875 | -15.3 |
| 24.0 | -18.9 |
| 24.0078125 | -12.7 |
| 24.015625 | -10.3 |
| 24.0234375 | -9.6 |
| 24.03125 | -2.3 |
| 24.0390625 | -1.1 |
| 24.046875 | -10.1 |
| 24.0546875 | -16.8 |
| 24.0625 | -13 |
| 24.0703125 | -8.6 |
| 24.078125 | -13.2 |
| 24.0859375 | -16.2 |
| 24.09375 | -11.2 |
| 24.1015625 | -6.8 |
| 24.109375 | -4.6 |
| 24.1171875 | -2.1 |
| 24.125 | 3 |
| 24.1328125 | 11.6 |
| 24.140625 | 17.3 |
| 24.1484375 | 18.6 |
| 24.15625 | 23 |
| 24.1640625 | 30.6 |
| 24.171875 | 37.1 |
| 24.1796875 | 36.9 |
| 24.1875 | 25 |
| 24.1953125 | 17 |
| 24.203125 | 28.9 |
| 24.2109375 | 40.3 |
| 24.21875 | 32.9 |
| 24.2265625 | 23 |
| 24.234375 | 21 |
| 24.2421875 | 21.7 |
| 24.25 | 21.2 |
| 24.2578125 | 13.9 |
| 24.265625 | 4.2 |
| 24.2734375 | -0.6 |
| 24.28125 | -7.3 |
| 24.2890625 | -17.2 |
| 24.296875 | -24.6 |
| 24.3046875 | -26.8 |
| 24.3125 | -22.8 |
| 24.3203125 | -26.2 |
| 24.328125 | -42.1 |
| 24.3359375 | -50.4 |
| 24.34375 | -50.8 |
| 24.3515625 | -52.9 |
| 24.359375 | -50.1 |
| 24.3671875 | -52.9 |
| 24.375 | -59.3 |
| 24.3828125 | -44.7 |
| 24.390625 | -26.6 |
| 24.3984375 | -25.3 |
| 24.40625 | -23 |
| 24.4140625 | -20.1 |
| 24.421875 | -21.1 |
| 24.4296875 | -17.4 |
| 24.4375 | -18.8 |
| 24.4453125 | -20.6 |
| 24.453125 | -15.1 |
| 24.4609375 | -21.1 |
| 24.46875 | -31.2 |
| 24.4765625 | -29.3 |
| 24.484375 | -27.4 |
| 24.4921875 | -26.1 |
| 24.5 | -23.6 |
| 24.5078125 | -26 |
| 24.515625 | -24.8 |
| 24.5234375 | -21.8 |
| 24.53125 | -23.7 |
| 24.5390625 | -21.8 |
| 24.546875 | -17.8 |
| 24.5546875 | -16.5 |
| 24.5625 | -15.1 |
| 24.5703125 | -16.9 |
| 24.578125 | -18.7 |
| 24.5859375 | -15.7 |
| 24.59375 | -11 |
| 24.6015625 | -3.7 |
| 24.609375 | 4.4 |
| 24.6171875 | 10.6 |
| 24.625 | 16.7 |
| 24.6328125 | 19.4 |
| 24.640625 | 19.8 |
| 24.6484375 | 19.3 |
| 24.65625 | 12.8 |
| 24.6640625 | 8.8 |
| 24.671875 | 9.6 |
| 24.6796875 | 0.8 |
| 24.6875 | -12.6 |
| 24.6953125 | -19.1 |
| 24.703125 | -24.7 |
| 24.7109375 | -28.2 |
| 24.71875 | -29.5 |
| 24.7265625 | -34 |
| 24.734375 | -30.6 |
| 24.7421875 | -19.3 |
| 24.75 | -19.1 |
| 24.7578125 | -20 |
| 24.765625 | -7 |
| 24.7734375 | 1.4 |
| 24.78125 | -1.1 |
| 24.7890625 | 2.3 |
| 24.796875 | 8 |
| 24.8046875 | 5.2 |
| 24.8125 | -2.5 |
| 24.8203125 | -10.6 |
| 24.828125 | -16.2 |
| 24.8359375 | -19.9 |
| 24.84375 | -25 |
| 24.8515625 | -28.3 |
| 24.859375 | -30.2 |
| 24.8671875 | -30.9 |
| 24.875 | -23.1 |
| 24.8828125 | -11.5 |
| 24.890625 | -9.8 |
| 24.8984375 | -12.9 |
| 24.90625 | -8.5 |
| 24.9140625 | -3.9 |
| 24.921875 | -5.8 |
| 24.9296875 | -4.1 |
| 24.9375 | -3.4 |
| 24.9453125 | -10.5 |
| 24.953125 | -10.2 |
| 24.9609375 | -8.6 |
| 24.96875 | -17.7 |
| 24.9765625 | -20.2 |
| 24.984375 | -15.7 |
| 24.9921875 | -12.1 |
| 25.0 | -2.2 |
| 25.0078125 | -1.4 |
| 25.015625 | -12.3 |
| 25.0234375 | -12.2 |
| 25.03125 | -8.6 |
| 25.0390625 | -12.2 |
| 25.046875 | -15.4 |
| 25.0546875 | -16.9 |
| 25.0625 | -12 |
| 25.0703125 | -3 |
| 25.078125 | -1.9 |
| 25.0859375 | -0.2 |
| 25.09375 | 9.5 |
| 25.1015625 | 13.5 |
| 25.109375 | 8.6 |
| 25.1171875 | 9 |
| 25.125 | 16.2 |
| 25.1328125 | 19.5 |
| 25.140625 | 19.8 |
| 25.1484375 | 18.8 |
| 25.15625 | 16.4 |
| 25.1640625 | 24.2 |
| 25.171875 | 36.6 |
| 25.1796875 | 35.4 |
| 25.1875 | 32.1 |
| 25.1953125 | 37.8 |
| 25.203125 | 42.7 |
| 25.2109375 | 45 |
| 25.21875 | 46.3 |
| 25.2265625 | 44.9 |
| 25.234375 | 42.9 |
| 25.2421875 | 41.4 |
| 25.25 | 42.3 |
| 25.2578125 | 42 |
| 25.265625 | 37 |
| 25.2734375 | 37.5 |
| 25.28125 | 40.4 |
| 25.2890625 | 31.2 |
| 25.296875 | 23.3 |
| 25.3046875 | 27.9 |
| 25.3125 | 29.2 |
| 25.3203125 | 28.6 |
| 25.328125 | 37 |
| 25.3359375 | 41.4 |
| 25.34375 | 36.8 |
| 25.3515625 | 35.5 |
| 25.359375 | 36.2 |
| 25.3671875 | 30.6 |
| 25.375 | 24.4 |
| 25.3828125 | 31 |
| 25.390625 | 44.2 |
| 25.3984375 | 43.1 |
| 25.40625 | 33.4 |
| 25.4140625 | 30 |
| 25.421875 | 26.8 |
| 25.4296875 | 22.9 |
| 25.4375 | 17.9 |
| 25.4453125 | 12.1 |
| 25.453125 | 18.9 |
| 25.4609375 | 25.2 |
| 25.46875 | 17.6 |
| 25.4765625 | 20.1 |
| 25.484375 | 28.6 |
| 25.4921875 | 24.5 |
| 25.5 | 25.8 |
| 25.5078125 | 32.6 |
| 25.515625 | 28.7 |
| 25.5234375 | 22.4 |
| 25.53125 | 16.5 |
| 25.5390625 | 10.4 |
| 25.546875 | 9.7 |
| 25.5546875 | 5.5 |
| 25.5625 | -4.5 |
| 25.5703125 | -8.2 |
| 25.578125 | -11.1 |
| 25.5859375 | -21.6 |
| 25.59375 | -26.4 |
| 25.6015625 | -19.9 |
| 25.609375 | -14.9 |
| 25.6171875 | -14.8 |
| 25.625 | -16.7 |
| 25.6328125 | -21 |
| 25.640625 | -25.6 |
| 25.6484375 | -28.3 |
| 25.65625 | -26.9 |
| 25.6640625 | -23.6 |
| 25.671875 | -25.5 |
| 25.6796875 | -27.9 |
| 25.6875 | -26.9 |
| 25.6953125 | -27.2 |
| 25.703125 | -25.8 |
| 25.7109375 | -23.1 |
| 25.71875 | -27.8 |
| 25.7265625 | -35.6 |
| 25.734375 | -34.1 |
| 25.7421875 | -28.3 |
| 25.75 | -32 |
| 25.7578125 | -31.6 |
| 25.765625 | -16 |
| 25.7734375 | -8.6 |
| 25.78125 | -7.8 |
| 25.7890625 | 0.6 |
| 25.796875 | -2.8 |
| 25.8046875 | -10.6 |
| 25.8125 | -2.5 |
| 25.8203125 | 1.2 |
| 25.828125 | -2.8 |
| 25.8359375 | -0.2 |
| 25.84375 | 2.9 |
| 25.8515625 | 4.4 |
| 25.859375 | 4.2 |
| 25.8671875 | 3.4 |
| 25.875 | 6.4 |
| 25.8828125 | 3.6 |
| 25.890625 | -4 |
| 25.8984375 | -8.3 |
| 25.90625 | -13.9 |
| 25.9140625 | -15.4 |
| 25.921875 | -8.3 |
| 25.9296875 | -4.1 |
| 25.9375 | -2.7 |
| 25.9453125 | 4.3 |
| 25.953125 | 14.6 |
| 25.9609375 | 19.5 |
| 25.96875 | 18.7 |
| 25.9765625 | 19.6 |
| 25.984375 | 21 |
| 25.9921875 | 16.6 |
| 26.0 | 6 |
| 26.0078125 | -8.2 |
| 26.015625 | -22.6 |
| 26.0234375 | -34.5 |
| 26.03125 | -36.1 |
| 26.0390625 | -28 |
| 26.046875 | -29.1 |
| 26.0546875 | -35.8 |
| 26.0625 | -28 |
| 26.0703125 | -17.9 |
| 26.078125 | -17.3 |
| 26.0859375 | -14.3 |
| 26.09375 | -8 |
| 26.1015625 | -2.2 |
| 26.109375 | 4 |
| 26.1171875 | 8.8 |
| 26.125 | 14.7 |
| 26.1328125 | 18.5 |
| 26.140625 | 16.8 |
| 26.1484375 | 13 |
| 26.15625 | 6.7 |
| 26.1640625 | 4.3 |
| 26.171875 | 4.3 |
| 26.1796875 | -6.8 |
| 26.1875 | -14 |
| 26.1953125 | -10.2 |
| 26.203125 | -14.6 |
| 26.2109375 | -16 |
| 26.21875 | -6.2 |
| 26.2265625 | -3.3 |
| 26.234375 | 1 |
| 26.2421875 | 12.8 |
| 26.25 | 19.9 |
| 26.2578125 | 25.7 |
| 26.265625 | 27.7 |
| 26.2734375 | 23.3 |
| 26.28125 | 21.4 |
| 26.2890625 | 14.8 |
| 26.296875 | 8.4 |
| 26.3046875 | 11.7 |
| 26.3125 | 7.3 |
| 26.3203125 | 0.7 |
| 26.328125 | 6.8 |
| 26.3359375 | 5.1 |
| 26.34375 | -4.4 |
| 26.3515625 | -1.9 |
| 26.359375 | -0.7 |
| 26.3671875 | -6.4 |
| 26.375 | -1.9 |
| 26.3828125 | 6.8 |
| 26.390625 | 9.1 |
| 26.3984375 | 14.8 |
| 26.40625 | 25.6 |
| 26.4140625 | 25.6 |
| 26.421875 | 14 |
| 26.4296875 | 11.5 |
| 26.4375 | 23.3 |
| 26.4453125 | 33.5 |
| 26.453125 | 34.6 |
| 26.4609375 | 29.4 |
| 26.46875 | 24 |
| 26.4765625 | 24 |
| 26.484375 | 27.7 |
| 26.4921875 | 34.8 |
| 26.5 | 44.1 |
| 26.5078125 | 47.5 |
| 26.515625 | 47.3 |
| 26.5234375 | 50.5 |
| 26.53125 | 49.8 |
| 26.5390625 | 38.8 |
| 26.546875 | 27.3 |
| 26.5546875 | 26.6 |
| 26.5625 | 28 |
| 26.5703125 | 20.9 |
| 26.578125 | 16.2 |
| 26.5859375 | 18.2 |
| 26.59375 | 16.5 |
| 26.6015625 | 15.4 |
| 26.609375 | 16.2 |
| 26.6171875 | 8.9 |
| 26.625 | -2.3 |
| 26.6328125 | -10.6 |
| 26.640625 | -17.2 |
| 26.6484375 | -18.7 |
| 26.65625 | -15.3 |
| 26.6640625 | -17.4 |
| 26.671875 | -25.3 |
| 26.6796875 | -25.1 |
| 26.6875 | -22.9 |
| 26.6953125 | -36 |
| 26.703125 | -46 |
| 26.7109375 | -37.8 |
| 26.71875 | -34.4 |
| 26.7265625 | -39.7 |
| 26.734375 | -38.3 |
| 26.7421875 | -39.6 |
| 26.75 | -49 |
| 26.7578125 | -53.6 |
| 26.765625 | -53.4 |
| 26.7734375 | -58.3 |
| 26.78125 | -63.5 |
| 26.7890625 | -58.5 |
| 26.796875 | -52.6 |
| 26.8046875 | -55.5 |
| 26.8125 | -54.9 |
| 26.8203125 | -49.4 |
| 26.828125 | -51.7 |
| 26.8359375 | -59 |
| 26.84375 | -65.6 |
| 26.8515625 | -70.6 |
| 26.859375 | -72.4 |
| 26.8671875 | -76.2 |
| 26.875 | -76.1 |
| 26.8828125 | -62.9 |
| 26.890625 | -56.5 |
| 26.8984375 | -63.1 |
| 26.90625 | -60.5 |
| 26.9140625 | -55.7 |
| 26.921875 | -63 |
| 26.9296875 | -69.8 |
| 26.9375 | -73 |
| 26.9453125 | -75.6 |
| 26.953125 | -75.5 |
| 26.9609375 | -78 |
| 26.96875 | -78.3 |
| 26.9765625 | -74.9 |
| 26.984375 | -75.7 |
| 26.9921875 | -68.7 |
| 27.0 | -54.2 |
| 27.0078125 | -51 |
| 27.015625 | -47.4 |
| 27.0234375 | -32.4 |
| 27.03125 | -20.9 |
| 27.0390625 | -10.8 |
| 27.046875 | 3.7 |
| 27.0546875 | 11 |
| 27.0625 | 13.1 |
| 27.0703125 | 18.9 |
| 27.078125 | 23.5 |
| 27.0859375 | 26.4 |
| 27.09375 | 30.3 |
| 27.1015625 | 30.5 |
| 27.109375 | 33 |
| 27.1171875 | 42.2 |
| 27.125 | 42.6 |
| 27.1328125 | 31.9 |
| 27.140625 | 26.6 |
| 27.1484375 | 27 |
| 27.15625 | 23.4 |
| 27.1640625 | 20.3 |
| 27.171875 | 25.9 |
| 27.1796875 | 38 |
| 27.1875 | 49.4 |
| 27.1953125 | 59.4 |
| 27.203125 | 66.9 |
| 27.2109375 | 66.9 |
| 27.21875 | 59.7 |
| 27.2265625 | 50.9 |
| 27.234375 | 44.5 |
| 27.2421875 | 42.5 |
| 27.25 | 47.1 |
| 27.2578125 | 57.9 |
| 27.265625 | 65.5 |
| 27.2734375 | 62.9 |
| 27.28125 | 54.8 |
| 27.2890625 | 42.7 |
| 27.296875 | 25.7 |
| 27.3046875 | 9.2 |
| 27.3125 | -3.2 |
| 27.3203125 | -7 |
| 27.328125 | -2.2 |
| 27.3359375 | 4.5 |
| 27.34375 | 12.6 |
| 27.3515625 | 19.1 |
| 27.359375 | 17.5 |
| 27.3671875 | 10.4 |
| 27.375 | -1.1 |
| 27.3828125 | -9.8 |
| 27.390625 | -3.1 |
| 27.3984375 | 9.5 |
| 27.40625 | 16.5 |
| 27.4140625 | 23.3 |
| 27.421875 | 32.3 |
| 27.4296875 | 44.1 |
| 27.4375 | 54 |
| 27.4453125 | 50.8 |
| 27.453125 | 41.2 |
| 27.4609375 | 33.5 |
| 27.46875 | 24.9 |
| 27.4765625 | 21.3 |
| 27.484375 | 23.6 |
| 27.4921875 | 20.9 |
| 27.5 | 18.5 |
| 27.5078125 | 20.5 |
| 27.515625 | 14.8 |
| 27.5234375 | 5.2 |
| 27.53125 | 1.3 |
| 27.5390625 | -2 |
| 27.546875 | 0.3 |
| 27.5546875 | 9.6 |
| 27.5625 | 12.1 |
| 27.5703125 | 15.9 |
| 27.578125 | 29.6 |
| 27.5859375 | 35.5 |
| 27.59375 | 34.2 |
| 27.6015625 | 36.6 |
| 27.609375 | 32.2 |
| 27.6171875 | 20.6 |
| 27.625 | 10.6 |
| 27.6328125 | 1.3 |
| 27.640625 | 0.9 |
| 27.6484375 | 12.9 |
| 27.65625 | 24.1 |
| 27.6640625 | 31.9 |
| 27.671875 | 36.8 |
| 27.6796875 | 33.3 |
| 27.6875 | 29.6 |
| 27.6953125 | 31.7 |
| 27.703125 | 28.8 |
| 27.7109375 | 19.6 |
| 27.71875 | 13.1 |
| 27.7265625 | 9.8 |
| 27.734375 | 9.9 |
| 27.7421875 | 9.3 |
| 27.75 | -2.6 |
| 27.7578125 | -23.1 |
| 27.765625 | -42.4 |
| 27.7734375 | -54.6 |
| 27.78125 | -55.9 |
| 27.7890625 | -52.7 |
| 27.796875 | -46.5 |
| 27.8046875 | -29.3 |
| 27.8125 | -10.8 |
| 27.8203125 | 3.7 |
| 27.828125 | 19.3 |
| 27.8359375 | 20.6 |
| 27.84375 | 9.1 |
| 27.8515625 | 9.8 |
| 27.859375 | 14.1 |
| 27.8671875 | 11.3 |
| 27.875 | 18.1 |
| 27.8828125 | 28.2 |
| 27.890625 | 28.8 |
| 27.8984375 | 29.8 |
| 27.90625 | 30.9 |
| 27.9140625 | 26.4 |
| 27.921875 | 20.4 |
| 27.9296875 | 10.6 |
| 27.9375 | 1.1 |
| 27.9453125 | 0.5 |
| 27.953125 | 0.6 |
| 27.9609375 | -3.6 |
| 27.96875 | -6.2 |
| 27.9765625 | -8.3 |
| 27.984375 | -8.2 |
| 27.9921875 | -5.9 |
| 28.0 | -10.4 |
| 28.0078125 | -18.2 |
| 28.015625 | -21.5 |
| 28.0234375 | -22.1 |
| 28.03125 | -19 |
| 28.0390625 | -17.5 |
| 28.046875 | -19 |
| 28.0546875 | -8.2 |
| 28.0625 | 6.8 |
| 28.0703125 | 5.7 |
| 28.078125 | 0.5 |
| 28.0859375 | 0.5 |
| 28.09375 | -1.8 |
| 28.1015625 | -5 |
| 28.109375 | -7.8 |
| 28.1171875 | -9.3 |
| 28.125 | -5.6 |
| 28.1328125 | -3.5 |
| 28.140625 | -6.8 |
| 28.1484375 | -5.4 |
| 28.15625 | 1.7 |
| 28.1640625 | 4.8 |
| 28.171875 | 9.2 |
| 28.1796875 | 20.6 |
| 28.1875 | 22.1 |
| 28.1953125 | 13.5 |
| 28.203125 | 17.4 |
| 28.2109375 | 24.7 |
| 28.21875 | 21.7 |
| 28.2265625 | 22.6 |
| 28.234375 | 24.7 |
| 28.2421875 | 20.9 |
| 28.25 | 23.8 |
| 28.2578125 | 25.4 |
| 28.265625 | 14 |
| 28.2734375 | 5.8 |
| 28.28125 | 1.1 |
| 28.2890625 | -9.6 |
| 28.296875 | -12.2 |
| 28.3046875 | -7.2 |
| 28.3125 | -8.5 |
| 28.3203125 | -5.5 |
| 28.328125 | 8.1 |
| 28.3359375 | 21.5 |
| 28.34375 | 33.5 |
| 28.3515625 | 40.5 |
| 28.359375 | 36.2 |
| 28.3671875 | 29.2 |
| 28.375 | 27.2 |
| 28.3828125 | 28.2 |
| 28.390625 | 27.3 |
| 28.3984375 | 25.7 |
| 28.40625 | 31.4 |
| 28.4140625 | 36.7 |
| 28.421875 | 29.1 |
| 28.4296875 | 17.4 |
| 28.4375 | 9.6 |
| 28.4453125 | 0.8 |
| 28.453125 | -10.4 |
| 28.4609375 | -16.9 |
| 28.46875 | -13.3 |
| 28.4765625 | -6.8 |
| 28.484375 | -0.2 |
| 28.4921875 | 11.3 |
| 28.5 | 14.1 |
| 28.5078125 | 1.7 |
| 28.515625 | -5.9 |
| 28.5234375 | -6.9 |
| 28.53125 | -13.6 |
| 28.5390625 | -18.9 |
| 28.546875 | -16.9 |
| 28.5546875 | -11.9 |
| 28.5625 | -3.3 |
| 28.5703125 | 10 |
| 28.578125 | 19.8 |
| 28.5859375 | 18.9 |
| 28.59375 | 13.6 |
| 28.6015625 | 10.9 |
| 28.609375 | 10.2 |
| 28.6171875 | 11.6 |
| 28.625 | 9.1 |
| 28.6328125 | 4.1 |
| 28.640625 | 7.1 |
| 28.6484375 | 8.2 |
| 28.65625 | 0 |
| 28.6640625 | -5.2 |
| 28.671875 | -7.4 |
| 28.6796875 | -6.6 |
| 28.6875 | 2.1 |
| 28.6953125 | 7.2 |
| 28.703125 | 7.5 |
| 28.7109375 | 12 |
| 28.71875 | 14.2 |
| 28.7265625 | 10.9 |
| 28.734375 | 5.2 |
| 28.7421875 | -3.1 |
| 28.75 | -9.7 |
| 28.7578125 | -12.1 |
| 28.765625 | -10.6 |
| 28.7734375 | -9 |
| 28.78125 | -12 |
| 28.7890625 | -15.1 |
| 28.796875 | -20.3 |
| 28.8046875 | -33.9 |
| 28.8125 | -46.7 |
| 28.8203125 | -55.7 |
| 28.828125 | -65.5 |
| 28.8359375 | -68.8 |
| 28.84375 | -65 |
| 28.8515625 | -61.6 |
| 28.859375 | -54 |
| 28.8671875 | -41.6 |
| 28.875 | -34.9 |
| 28.8828125 | -35.7 |
| 28.890625 | -41.5 |
| 28.8984375 | -49.3 |
| 28.90625 | -53 |
| 28.9140625 | -55.4 |
| 28.921875 | -58.3 |
| 28.9296875 | -50.7 |
| 28.9375 | -36.3 |
| 28.9453125 | -30.7 |
| 28.953125 | -30.3 |
| 28.9609375 | -29.6 |
| 28.96875 | -33.3 |
| 28.9765625 | -35.5 |
| 28.984375 | -31.2 |
| 28.9921875 | -29.5 |
| 29.0 | -29.8 |
| 29.0078125 | -21.3 |
| 29.015625 | -10.7 |
| 29.0234375 | -7.7 |
| 29.03125 | -8 |
| 29.0390625 | -7.1 |
| 29.046875 | -5.5 |
| 29.0546875 | -9.6 |
| 29.0625 | -19.5 |
| 29.0703125 | -19.8 |
| 29.078125 | -13.8 |
| 29.0859375 | -14.1 |
| 29.09375 | -9.9 |
| 29.1015625 | -1.1 |
| 29.109375 | 1.8 |
| 29.1171875 | 5.3 |
| 29.125 | 3.6 |
| 29.1328125 | -8.8 |
| 29.140625 | -15.9 |
| 29.1484375 | -14.7 |
| 29.15625 | -11.3 |
| 29.1640625 | -0.4 |
| 29.171875 | 15.1 |
| 29.1796875 | 23.7 |
| 29.1875 | 22.9 |
| 29.1953125 | 14.5 |
| 29.203125 | 2.7 |
| 29.2109375 | -1.7 |
| 29.21875 | 1.9 |
| 29.2265625 | 2.7 |
| 29.234375 | 7 |
| 29.2421875 | 21.9 |
| 29.25 | 33.5 |
| 29.2578125 | 38.5 |
| 29.265625 | 45 |
| 29.2734375 | 47.6 |
| 29.28125 | 40.3 |
| 29.2890625 | 30.6 |
| 29.296875 | 26.9 |
| 29.3046875 | 25.9 |
| 29.3125 | 21.1 |
| 29.3203125 | 14.2 |
| 29.328125 | 9.3 |
| 29.3359375 | 8.2 |
| 29.34375 | 6.4 |
| 29.3515625 | -0.2 |
| 29.359375 | -5.9 |
| 29.3671875 | -9.1 |
| 29.375 | -11 |
| 29.3828125 | -12.9 |
| 29.390625 | -18 |
| 29.3984375 | -17.5 |
| 29.40625 | -11.8 |
| 29.4140625 | -14.8 |
| 29.421875 | -19.1 |
| 29.4296875 | -19.3 |
| 29.4375 | -18.9 |
| 29.4453125 | -13.6 |
| 29.453125 | -12.2 |
| 29.4609375 | -18.4 |
| 29.46875 | -24.8 |
| 29.4765625 | -36.1 |
| 29.484375 | -44.3 |
| 29.4921875 | -47.9 |
| 29.5 | -57.5 |
| 29.5078125 | -58.5 |
| 29.515625 | -50.5 |
| 29.5234375 | -50.2 |
| 29.53125 | -53.2 |
| 29.5390625 | -56 |
| 29.546875 | -52 |
| 29.5546875 | -41.3 |
| 29.5625 | -39.7 |
| 29.5703125 | -37.1 |
| 29.578125 | -28.2 |
| 29.5859375 | -27.3 |
| 29.59375 | -21.2 |
| 29.6015625 | -9.3 |
| 29.609375 | -9.2 |
| 29.6171875 | -9.7 |
| 29.625 | -6.4 |
| 29.6328125 | -7.5 |
| 29.640625 | -8.3 |
| 29.6484375 | -12.7 |
| 29.65625 | -20.6 |
| 29.6640625 | -20 |
| 29.671875 | -20.8 |
| 29.6796875 | -31.5 |
| 29.6875 | -37.4 |
| 29.6953125 | -36.3 |
| 29.703125 | -35.8 |
| 29.7109375 | -32.8 |
| 29.71875 | -33.4 |
| 29.7265625 | -42.4 |
| 29.734375 | -47.5 |
| 29.7421875 | -45.7 |
| 29.75 | -45.6 |
| 29.7578125 | -47.7 |
| 29.765625 | -47.4 |
| 29.7734375 | -41.6 |
| 29.78125 | -33.7 |
| 29.7890625 | -28.8 |
| 29.796875 | -25.7 |
| 29.8046875 | -22.4 |
| 29.8125 | -16 |
| 29.8203125 | -7.3 |
| 29.828125 | -1.7 |
| 29.8359375 | 8.3 |
| 29.84375 | 25 |
| 29.8515625 | 27.3 |
| 29.859375 | 13.8 |
| 29.8671875 | 8.4 |
| 29.875 | 13 |
| 29.8828125 | 11.8 |
| 29.890625 | 10.9 |
| 29.8984375 | 21.3 |
| 29.90625 | 26.5 |
| 29.9140625 | 18.5 |
| 29.921875 | 16.6 |
| 29.9296875 | 22.7 |
| 29.9375 | 26.2 |
| 29.9453125 | 28.7 |
| 29.953125 | 30 |
| 29.9609375 | 31 |
| 29.96875 | 34.3 |
| 29.9765625 | 36 |
| 29.984375 | 38 |
| 29.9921875 | 41 |
| 30.0 | 38.2 |
| 30.0078125 | 30.1 |
| 30.015625 | 19.3 |
| 30.0234375 | 11.4 |
| 30.03125 | 14.2 |
| 30.0390625 | 20 |
| 30.046875 | 24.1 |
| 30.0546875 | 34.3 |
| 30.0625 | 44.9 |
| 30.0703125 | 45.4 |
| 30.078125 | 40.9 |
| 30.0859375 | 38.7 |
| 30.09375 | 38.8 |
| 30.1015625 | 39.3 |
| 30.109375 | 41.1 |
| 30.1171875 | 43.5 |
| 30.125 | 44.4 |
| 30.1328125 | 49.2 |
| 30.140625 | 56.2 |
| 30.1484375 | 57.9 |
| 30.15625 | 63.9 |
| 30.1640625 | 70 |
| 30.171875 | 65.2 |
| 30.1796875 | 67.2 |
| 30.1875 | 73.1 |
| 30.1953125 | 64.1 |
| 30.203125 | 61.3 |
| 30.2109375 | 71.6 |
| 30.21875 | 74.4 |
| 30.2265625 | 75.2 |
| 30.234375 | 78.5 |
| 30.2421875 | 73.4 |
| 30.25 | 59.3 |
| 30.2578125 | 42.8 |
| 30.265625 | 34.8 |
| 30.2734375 | 36.5 |
| 30.28125 | 38.3 |
| 30.2890625 | 39.1 |
| 30.296875 | 37.1 |
| 30.3046875 | 31.2 |
| 30.3125 | 24.6 |
| 30.3203125 | 17.7 |
| 30.328125 | 16.2 |
| 30.3359375 | 16.3 |
| 30.34375 | 8 |
| 30.3515625 | 3.9 |
| 30.359375 | 9.2 |
| 30.3671875 | 9 |
| 30.375 | 5.9 |
| 30.3828125 | 9.8 |
| 30.390625 | 16.7 |
| 30.3984375 | 20 |
| 30.40625 | 20.5 |
| 30.4140625 | 23.8 |
| 30.421875 | 27 |
| 30.4296875 | 25.9 |
| 30.4375 | 29.8 |
| 30.4453125 | 34.7 |
| 30.453125 | 26.7 |
| 30.4609375 | 16.8 |
| 30.46875 | 16.4 |
| 30.4765625 | 13.8 |
| 30.484375 | 5 |
| 30.4921875 | -5.6 |
| 30.5 | -16.4 |
| 30.5078125 | -21 |
| 30.515625 | -21.1 |
| 30.5234375 | -22.7 |
| 30.53125 | -24 |
| 30.5390625 | -27.7 |
| 30.546875 | -33.9 |
| 30.5546875 | -36.2 |
| 30.5625 | -37.2 |
| 30.5703125 | -39 |
| 30.578125 | -37.3 |
| 30.5859375 | -32.3 |
| 30.59375 | -23.9 |
| 30.6015625 | -11.8 |
| 30.609375 | -5.8 |
| 30.6171875 | -11.5 |
| 30.625 | -13.8 |
| 30.6328125 | -4.3 |
| 30.640625 | 0.1 |
| 30.6484375 | -6 |
| 30.65625 | -9.9 |
| 30.6640625 | -7.3 |
| 30.671875 | -0.2 |
| 30.6796875 | 4.8 |
| 30.6875 | 4.9 |
| 30.6953125 | 6.6 |
| 30.703125 | 6.9 |
| 30.7109375 | 4.3 |
| 30.71875 | 1 |
| 30.7265625 | -7.3 |
| 30.734375 | -12.8 |
| 30.7421875 | -11.1 |
| 30.75 | -8.7 |
| 30.7578125 | -3.1 |
| 30.765625 | -2.5 |
| 30.7734375 | -6.7 |
| 30.78125 | -4.5 |
| 30.7890625 | -11.6 |
| 30.796875 | -20.6 |
| 30.8046875 | -10.6 |
| 30.8125 | -8.6 |
| 30.8203125 | -15.3 |
| 30.828125 | -7.6 |
| 30.8359375 | -7.1 |
| 30.84375 | -12.4 |
| 30.8515625 | -7.2 |
| 30.859375 | -10.3 |
| 30.8671875 | -15.4 |
| 30.875 | -15.7 |
| 30.8828125 | -22.8 |
| 30.890625 | -17.2 |
| 30.8984375 | -8.7 |
| 30.90625 | -17.7 |
| 30.9140625 | -10.1 |
| 30.921875 | 4.4 |
| 30.9296875 | -4.1 |
| 30.9375 | -5.1 |
| 30.9453125 | -0.2 |
| 30.953125 | -9.5 |
| 30.9609375 | -13.8 |
| 30.96875 | -15.1 |
| 30.9765625 | -21.8 |
| 30.984375 | -29.1 |
| 30.9921875 | -37.3 |
| 31.0 | -29.1 |
| 31.0078125 | -11.1 |
| 31.015625 | -7.8 |
| 31.0234375 | -10.8 |
| 31.03125 | -15 |
| 31.0390625 | -14.5 |
| 31.046875 | -4.4 |
| 31.0546875 | -5.9 |
| 31.0625 | -8.1 |
| 31.0703125 | -1.6 |
| 31.078125 | -8.7 |
| 31.0859375 | -12.4 |
| 31.09375 | -4.9 |
| 31.1015625 | -7.9 |
| 31.109375 | -9.2 |
| 31.1171875 | -9.9 |
| 31.125 | -16.3 |
| 31.1328125 | -10.5 |
| 31.140625 | -5.5 |
| 31.1484375 | -8.6 |
| 31.15625 | -7.2 |
| 31.1640625 | -12.5 |
| 31.171875 | -22 |
| 31.1796875 | -23.9 |
| 31.1875 | -24.4 |
| 31.1953125 | -22.6 |
| 31.203125 | -19.9 |
| 31.2109375 | -14.7 |
| 31.21875 | -1.1 |
| 31.2265625 | 4.4 |
| 31.234375 | 0.7 |
| 31.2421875 | 2.1 |
| 31.25 | -1.5 |
| 31.2578125 | -9 |
| 31.265625 | -6.2 |
| 31.2734375 | -4.2 |
| 31.28125 | -13.7 |
| 31.2890625 | -18.9 |
| 31.296875 | -6.8 |
| 31.3046875 | 8.2 |
| 31.3125 | 8 |
| 31.3203125 | 3.4 |
| 31.328125 | 7.2 |
| 31.3359375 | 9.4 |
| 31.34375 | 5.4 |
| 31.3515625 | 0.3 |
| 31.359375 | -7.9 |
| 31.3671875 | -11.3 |
| 31.375 | -0.7 |
| 31.3828125 | 6.9 |
| 31.390625 | 0.4 |
| 31.3984375 | -1.7 |
| 31.40625 | 6.1 |
| 31.4140625 | 8.9 |
| 31.421875 | 7.3 |
| 31.4296875 | 6.6 |
| 31.4375 | 4.4 |
| 31.4453125 | 3.8 |
| 31.453125 | 4.4 |
| 31.4609375 | 0.4 |
| 31.46875 | -4.8 |
| 31.4765625 | -8.9 |
| 31.484375 | -10.8 |
| 31.4921875 | -9.3 |
| 31.5 | -15.7 |
| 31.5078125 | -27.5 |
| 31.515625 | -28.4 |
| 31.5234375 | -21.6 |
| 31.53125 | -15.9 |
| 31.5390625 | -15.1 |
| 31.546875 | -18.2 |
| 31.5546875 | -14.1 |
| 31.5625 | -7.5 |
| 31.5703125 | -6.5 |
| 31.578125 | -3.5 |
| 31.5859375 | -5.3 |
| 31.59375 | -6.7 |
| 31.6015625 | 10 |
| 31.609375 | 25.9 |
| 31.6171875 | 32.6 |
| 31.625 | 44.6 |
| 31.6328125 | 52.9 |
| 31.640625 | 54.7 |
| 31.6484375 | 57.3 |
| 31.65625 | 57.9 |
| 31.6640625 | 57.6 |
| 31.671875 | 51.9 |
| 31.6796875 | 44.1 |
| 31.6875 | 44.2 |
| 31.6953125 | 39.5 |
| 31.703125 | 31.4 |
| 31.7109375 | 35.1 |
| 31.71875 | 36.3 |
| 31.7265625 | 23.7 |
| 31.734375 | 8.5 |
| 31.7421875 | -1.4 |
| 31.75 | -4.3 |
| 31.7578125 | -2.8 |
| 31.765625 | 0.5 |
| 31.7734375 | 6 |
| 31.78125 | 15.5 |
| 31.7890625 | 29.7 |
| 31.796875 | 35.2 |
| 31.8046875 | 27.4 |
| 31.8125 | 25.8 |
| 31.8203125 | 30 |
| 31.828125 | 27.8 |
| 31.8359375 | 26.2 |
| 31.84375 | 21 |
| 31.8515625 | 9.9 |
| 31.859375 | 10.9 |
| 31.8671875 | 19.8 |
| 31.875 | 20.3 |
| 31.8828125 | 19.4 |
| 31.890625 | 21.6 |
| 31.8984375 | 17.9 |
| 31.90625 | 8.3 |
| 31.9140625 | 0.8 |
| 31.921875 | -3.2 |
| 31.9296875 | -0.9 |
| 31.9375 | 10.5 |
| 31.9453125 | 22.3 |
| 31.953125 | 28.3 |
| 31.9609375 | 30.1 |
| 31.96875 | 26.2 |
| 31.9765625 | 21 |
| 31.984375 | 16.3 |
| 31.9921875 | 7.3 |